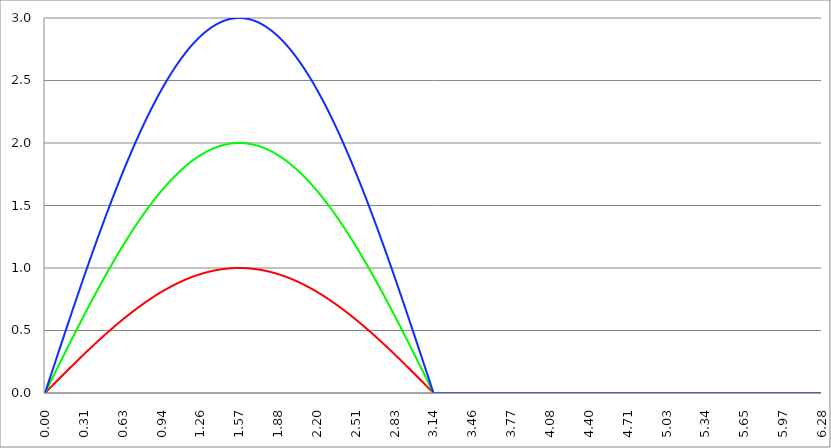
| Category | Series 1 | Series 0 | Series 2 |
|---|---|---|---|
| 0.0 | 0 | 0 | 0 |
| 0.00314159265358979 | 0.003 | 0.006 | 0.009 |
| 0.00628318530717958 | 0.006 | 0.013 | 0.019 |
| 0.00942477796076938 | 0.009 | 0.019 | 0.028 |
| 0.0125663706143592 | 0.013 | 0.025 | 0.038 |
| 0.015707963267949 | 0.016 | 0.031 | 0.047 |
| 0.0188495559215388 | 0.019 | 0.038 | 0.057 |
| 0.0219911485751285 | 0.022 | 0.044 | 0.066 |
| 0.0251327412287183 | 0.025 | 0.05 | 0.075 |
| 0.0282743338823081 | 0.028 | 0.057 | 0.085 |
| 0.0314159265358979 | 0.031 | 0.063 | 0.094 |
| 0.0345575191894877 | 0.035 | 0.069 | 0.104 |
| 0.0376991118430775 | 0.038 | 0.075 | 0.113 |
| 0.0408407044966673 | 0.041 | 0.082 | 0.122 |
| 0.0439822971502571 | 0.044 | 0.088 | 0.132 |
| 0.0471238898038469 | 0.047 | 0.094 | 0.141 |
| 0.0502654824574367 | 0.05 | 0.1 | 0.151 |
| 0.0534070751110265 | 0.053 | 0.107 | 0.16 |
| 0.0565486677646163 | 0.057 | 0.113 | 0.17 |
| 0.059690260418206 | 0.06 | 0.119 | 0.179 |
| 0.0628318530717958 | 0.063 | 0.126 | 0.188 |
| 0.0659734457253856 | 0.066 | 0.132 | 0.198 |
| 0.0691150383789754 | 0.069 | 0.138 | 0.207 |
| 0.0722566310325652 | 0.072 | 0.144 | 0.217 |
| 0.075398223686155 | 0.075 | 0.151 | 0.226 |
| 0.0785398163397448 | 0.078 | 0.157 | 0.235 |
| 0.0816814089933346 | 0.082 | 0.163 | 0.245 |
| 0.0848230016469244 | 0.085 | 0.169 | 0.254 |
| 0.0879645943005142 | 0.088 | 0.176 | 0.264 |
| 0.091106186954104 | 0.091 | 0.182 | 0.273 |
| 0.0942477796076937 | 0.094 | 0.188 | 0.282 |
| 0.0973893722612835 | 0.097 | 0.194 | 0.292 |
| 0.100530964914873 | 0.1 | 0.201 | 0.301 |
| 0.103672557568463 | 0.103 | 0.207 | 0.31 |
| 0.106814150222053 | 0.107 | 0.213 | 0.32 |
| 0.109955742875643 | 0.11 | 0.219 | 0.329 |
| 0.113097335529233 | 0.113 | 0.226 | 0.339 |
| 0.116238928182822 | 0.116 | 0.232 | 0.348 |
| 0.119380520836412 | 0.119 | 0.238 | 0.357 |
| 0.122522113490002 | 0.122 | 0.244 | 0.367 |
| 0.125663706143592 | 0.125 | 0.251 | 0.376 |
| 0.128805298797181 | 0.128 | 0.257 | 0.385 |
| 0.131946891450771 | 0.132 | 0.263 | 0.395 |
| 0.135088484104361 | 0.135 | 0.269 | 0.404 |
| 0.138230076757951 | 0.138 | 0.276 | 0.413 |
| 0.141371669411541 | 0.141 | 0.282 | 0.423 |
| 0.14451326206513 | 0.144 | 0.288 | 0.432 |
| 0.14765485471872 | 0.147 | 0.294 | 0.441 |
| 0.15079644737231 | 0.15 | 0.3 | 0.451 |
| 0.1539380400259 | 0.153 | 0.307 | 0.46 |
| 0.15707963267949 | 0.156 | 0.313 | 0.469 |
| 0.160221225333079 | 0.16 | 0.319 | 0.479 |
| 0.163362817986669 | 0.163 | 0.325 | 0.488 |
| 0.166504410640259 | 0.166 | 0.331 | 0.497 |
| 0.169646003293849 | 0.169 | 0.338 | 0.507 |
| 0.172787595947439 | 0.172 | 0.344 | 0.516 |
| 0.175929188601028 | 0.175 | 0.35 | 0.525 |
| 0.179070781254618 | 0.178 | 0.356 | 0.534 |
| 0.182212373908208 | 0.181 | 0.362 | 0.544 |
| 0.185353966561798 | 0.184 | 0.369 | 0.553 |
| 0.188495559215388 | 0.187 | 0.375 | 0.562 |
| 0.191637151868977 | 0.19 | 0.381 | 0.571 |
| 0.194778744522567 | 0.194 | 0.387 | 0.581 |
| 0.197920337176157 | 0.197 | 0.393 | 0.59 |
| 0.201061929829747 | 0.2 | 0.399 | 0.599 |
| 0.204203522483336 | 0.203 | 0.406 | 0.608 |
| 0.207345115136926 | 0.206 | 0.412 | 0.618 |
| 0.210486707790516 | 0.209 | 0.418 | 0.627 |
| 0.213628300444106 | 0.212 | 0.424 | 0.636 |
| 0.216769893097696 | 0.215 | 0.43 | 0.645 |
| 0.219911485751285 | 0.218 | 0.436 | 0.654 |
| 0.223053078404875 | 0.221 | 0.442 | 0.664 |
| 0.226194671058465 | 0.224 | 0.449 | 0.673 |
| 0.229336263712055 | 0.227 | 0.455 | 0.682 |
| 0.232477856365645 | 0.23 | 0.461 | 0.691 |
| 0.235619449019234 | 0.233 | 0.467 | 0.7 |
| 0.238761041672824 | 0.236 | 0.473 | 0.709 |
| 0.241902634326414 | 0.24 | 0.479 | 0.719 |
| 0.245044226980004 | 0.243 | 0.485 | 0.728 |
| 0.248185819633594 | 0.246 | 0.491 | 0.737 |
| 0.251327412287183 | 0.249 | 0.497 | 0.746 |
| 0.254469004940773 | 0.252 | 0.503 | 0.755 |
| 0.257610597594363 | 0.255 | 0.51 | 0.764 |
| 0.260752190247953 | 0.258 | 0.516 | 0.773 |
| 0.263893782901543 | 0.261 | 0.522 | 0.783 |
| 0.267035375555132 | 0.264 | 0.528 | 0.792 |
| 0.270176968208722 | 0.267 | 0.534 | 0.801 |
| 0.273318560862312 | 0.27 | 0.54 | 0.81 |
| 0.276460153515902 | 0.273 | 0.546 | 0.819 |
| 0.279601746169492 | 0.276 | 0.552 | 0.828 |
| 0.282743338823082 | 0.279 | 0.558 | 0.837 |
| 0.285884931476671 | 0.282 | 0.564 | 0.846 |
| 0.289026524130261 | 0.285 | 0.57 | 0.855 |
| 0.292168116783851 | 0.288 | 0.576 | 0.864 |
| 0.295309709437441 | 0.291 | 0.582 | 0.873 |
| 0.298451302091031 | 0.294 | 0.588 | 0.882 |
| 0.30159289474462 | 0.297 | 0.594 | 0.891 |
| 0.30473448739821 | 0.3 | 0.6 | 0.9 |
| 0.3078760800518 | 0.303 | 0.606 | 0.909 |
| 0.31101767270539 | 0.306 | 0.612 | 0.918 |
| 0.31415926535898 | 0.309 | 0.618 | 0.927 |
| 0.31730085801257 | 0.312 | 0.624 | 0.936 |
| 0.320442450666159 | 0.315 | 0.63 | 0.945 |
| 0.323584043319749 | 0.318 | 0.636 | 0.954 |
| 0.326725635973339 | 0.321 | 0.642 | 0.963 |
| 0.329867228626929 | 0.324 | 0.648 | 0.972 |
| 0.333008821280519 | 0.327 | 0.654 | 0.981 |
| 0.336150413934108 | 0.33 | 0.66 | 0.99 |
| 0.339292006587698 | 0.333 | 0.666 | 0.998 |
| 0.342433599241288 | 0.336 | 0.672 | 1.007 |
| 0.345575191894878 | 0.339 | 0.677 | 1.016 |
| 0.348716784548468 | 0.342 | 0.683 | 1.025 |
| 0.351858377202058 | 0.345 | 0.689 | 1.034 |
| 0.354999969855647 | 0.348 | 0.695 | 1.043 |
| 0.358141562509237 | 0.351 | 0.701 | 1.052 |
| 0.361283155162827 | 0.353 | 0.707 | 1.06 |
| 0.364424747816417 | 0.356 | 0.713 | 1.069 |
| 0.367566340470007 | 0.359 | 0.719 | 1.078 |
| 0.370707933123597 | 0.362 | 0.725 | 1.087 |
| 0.373849525777186 | 0.365 | 0.73 | 1.096 |
| 0.376991118430776 | 0.368 | 0.736 | 1.104 |
| 0.380132711084366 | 0.371 | 0.742 | 1.113 |
| 0.383274303737956 | 0.374 | 0.748 | 1.122 |
| 0.386415896391546 | 0.377 | 0.754 | 1.131 |
| 0.389557489045135 | 0.38 | 0.76 | 1.139 |
| 0.392699081698725 | 0.383 | 0.765 | 1.148 |
| 0.395840674352315 | 0.386 | 0.771 | 1.157 |
| 0.398982267005905 | 0.388 | 0.777 | 1.165 |
| 0.402123859659495 | 0.391 | 0.783 | 1.174 |
| 0.405265452313085 | 0.394 | 0.789 | 1.183 |
| 0.408407044966674 | 0.397 | 0.794 | 1.191 |
| 0.411548637620264 | 0.4 | 0.8 | 1.2 |
| 0.414690230273854 | 0.403 | 0.806 | 1.209 |
| 0.417831822927444 | 0.406 | 0.812 | 1.217 |
| 0.420973415581034 | 0.409 | 0.817 | 1.226 |
| 0.424115008234623 | 0.412 | 0.823 | 1.235 |
| 0.427256600888213 | 0.414 | 0.829 | 1.243 |
| 0.430398193541803 | 0.417 | 0.834 | 1.252 |
| 0.433539786195393 | 0.42 | 0.84 | 1.26 |
| 0.436681378848983 | 0.423 | 0.846 | 1.269 |
| 0.439822971502573 | 0.426 | 0.852 | 1.277 |
| 0.442964564156162 | 0.429 | 0.857 | 1.286 |
| 0.446106156809752 | 0.431 | 0.863 | 1.294 |
| 0.449247749463342 | 0.434 | 0.869 | 1.303 |
| 0.452389342116932 | 0.437 | 0.874 | 1.311 |
| 0.455530934770522 | 0.44 | 0.88 | 1.32 |
| 0.458672527424111 | 0.443 | 0.886 | 1.328 |
| 0.461814120077701 | 0.446 | 0.891 | 1.337 |
| 0.464955712731291 | 0.448 | 0.897 | 1.345 |
| 0.468097305384881 | 0.451 | 0.902 | 1.354 |
| 0.471238898038471 | 0.454 | 0.908 | 1.362 |
| 0.474380490692061 | 0.457 | 0.914 | 1.37 |
| 0.47752208334565 | 0.46 | 0.919 | 1.379 |
| 0.48066367599924 | 0.462 | 0.925 | 1.387 |
| 0.48380526865283 | 0.465 | 0.93 | 1.395 |
| 0.48694686130642 | 0.468 | 0.936 | 1.404 |
| 0.49008845396001 | 0.471 | 0.941 | 1.412 |
| 0.493230046613599 | 0.473 | 0.947 | 1.42 |
| 0.496371639267189 | 0.476 | 0.952 | 1.429 |
| 0.499513231920779 | 0.479 | 0.958 | 1.437 |
| 0.502654824574369 | 0.482 | 0.964 | 1.445 |
| 0.505796417227959 | 0.485 | 0.969 | 1.454 |
| 0.508938009881549 | 0.487 | 0.975 | 1.462 |
| 0.512079602535138 | 0.49 | 0.98 | 1.47 |
| 0.515221195188728 | 0.493 | 0.985 | 1.478 |
| 0.518362787842318 | 0.495 | 0.991 | 1.486 |
| 0.521504380495908 | 0.498 | 0.996 | 1.495 |
| 0.524645973149498 | 0.501 | 1.002 | 1.503 |
| 0.527787565803087 | 0.504 | 1.007 | 1.511 |
| 0.530929158456677 | 0.506 | 1.013 | 1.519 |
| 0.534070751110267 | 0.509 | 1.018 | 1.527 |
| 0.537212343763857 | 0.512 | 1.023 | 1.535 |
| 0.540353936417447 | 0.514 | 1.029 | 1.543 |
| 0.543495529071037 | 0.517 | 1.034 | 1.551 |
| 0.546637121724626 | 0.52 | 1.04 | 1.559 |
| 0.549778714378216 | 0.522 | 1.045 | 1.567 |
| 0.552920307031806 | 0.525 | 1.05 | 1.576 |
| 0.556061899685396 | 0.528 | 1.056 | 1.584 |
| 0.559203492338986 | 0.531 | 1.061 | 1.592 |
| 0.562345084992576 | 0.533 | 1.066 | 1.6 |
| 0.565486677646165 | 0.536 | 1.072 | 1.607 |
| 0.568628270299755 | 0.538 | 1.077 | 1.615 |
| 0.571769862953345 | 0.541 | 1.082 | 1.623 |
| 0.574911455606935 | 0.544 | 1.088 | 1.631 |
| 0.578053048260525 | 0.546 | 1.093 | 1.639 |
| 0.581194640914114 | 0.549 | 1.098 | 1.647 |
| 0.584336233567704 | 0.552 | 1.103 | 1.655 |
| 0.587477826221294 | 0.554 | 1.109 | 1.663 |
| 0.590619418874884 | 0.557 | 1.114 | 1.671 |
| 0.593761011528474 | 0.559 | 1.119 | 1.678 |
| 0.596902604182064 | 0.562 | 1.124 | 1.686 |
| 0.600044196835653 | 0.565 | 1.129 | 1.694 |
| 0.603185789489243 | 0.567 | 1.135 | 1.702 |
| 0.606327382142833 | 0.57 | 1.14 | 1.71 |
| 0.609468974796423 | 0.572 | 1.145 | 1.717 |
| 0.612610567450013 | 0.575 | 1.15 | 1.725 |
| 0.615752160103602 | 0.578 | 1.155 | 1.733 |
| 0.618893752757192 | 0.58 | 1.16 | 1.74 |
| 0.622035345410782 | 0.583 | 1.165 | 1.748 |
| 0.625176938064372 | 0.585 | 1.17 | 1.756 |
| 0.628318530717962 | 0.588 | 1.176 | 1.763 |
| 0.631460123371551 | 0.59 | 1.181 | 1.771 |
| 0.634601716025141 | 0.593 | 1.186 | 1.779 |
| 0.637743308678731 | 0.595 | 1.191 | 1.786 |
| 0.640884901332321 | 0.598 | 1.196 | 1.794 |
| 0.644026493985911 | 0.6 | 1.201 | 1.801 |
| 0.647168086639501 | 0.603 | 1.206 | 1.809 |
| 0.65030967929309 | 0.605 | 1.211 | 1.816 |
| 0.65345127194668 | 0.608 | 1.216 | 1.824 |
| 0.65659286460027 | 0.61 | 1.221 | 1.831 |
| 0.65973445725386 | 0.613 | 1.226 | 1.839 |
| 0.66287604990745 | 0.615 | 1.231 | 1.846 |
| 0.666017642561039 | 0.618 | 1.236 | 1.854 |
| 0.669159235214629 | 0.62 | 1.241 | 1.861 |
| 0.672300827868219 | 0.623 | 1.246 | 1.868 |
| 0.675442420521809 | 0.625 | 1.25 | 1.876 |
| 0.678584013175399 | 0.628 | 1.255 | 1.883 |
| 0.681725605828989 | 0.63 | 1.26 | 1.89 |
| 0.684867198482578 | 0.633 | 1.265 | 1.898 |
| 0.688008791136168 | 0.635 | 1.27 | 1.905 |
| 0.691150383789758 | 0.637 | 1.275 | 1.912 |
| 0.694291976443348 | 0.64 | 1.28 | 1.92 |
| 0.697433569096938 | 0.642 | 1.285 | 1.927 |
| 0.700575161750528 | 0.645 | 1.289 | 1.934 |
| 0.703716754404117 | 0.647 | 1.294 | 1.941 |
| 0.706858347057707 | 0.649 | 1.299 | 1.948 |
| 0.709999939711297 | 0.652 | 1.304 | 1.956 |
| 0.713141532364887 | 0.654 | 1.308 | 1.963 |
| 0.716283125018477 | 0.657 | 1.313 | 1.97 |
| 0.719424717672066 | 0.659 | 1.318 | 1.977 |
| 0.722566310325656 | 0.661 | 1.323 | 1.984 |
| 0.725707902979246 | 0.664 | 1.327 | 1.991 |
| 0.728849495632836 | 0.666 | 1.332 | 1.998 |
| 0.731991088286426 | 0.668 | 1.337 | 2.005 |
| 0.735132680940016 | 0.671 | 1.341 | 2.012 |
| 0.738274273593605 | 0.673 | 1.346 | 2.019 |
| 0.741415866247195 | 0.675 | 1.351 | 2.026 |
| 0.744557458900785 | 0.678 | 1.355 | 2.033 |
| 0.747699051554375 | 0.68 | 1.36 | 2.04 |
| 0.750840644207965 | 0.682 | 1.365 | 2.047 |
| 0.753982236861554 | 0.685 | 1.369 | 2.054 |
| 0.757123829515144 | 0.687 | 1.374 | 2.061 |
| 0.760265422168734 | 0.689 | 1.378 | 2.067 |
| 0.763407014822324 | 0.691 | 1.383 | 2.074 |
| 0.766548607475914 | 0.694 | 1.387 | 2.081 |
| 0.769690200129504 | 0.696 | 1.392 | 2.088 |
| 0.772831792783093 | 0.698 | 1.396 | 2.094 |
| 0.775973385436683 | 0.7 | 1.401 | 2.101 |
| 0.779114978090273 | 0.703 | 1.405 | 2.108 |
| 0.782256570743863 | 0.705 | 1.41 | 2.115 |
| 0.785398163397453 | 0.707 | 1.414 | 2.121 |
| 0.788539756051042 | 0.709 | 1.419 | 2.128 |
| 0.791681348704632 | 0.712 | 1.423 | 2.135 |
| 0.794822941358222 | 0.714 | 1.427 | 2.141 |
| 0.797964534011812 | 0.716 | 1.432 | 2.148 |
| 0.801106126665402 | 0.718 | 1.436 | 2.154 |
| 0.804247719318992 | 0.72 | 1.441 | 2.161 |
| 0.807389311972581 | 0.722 | 1.445 | 2.167 |
| 0.810530904626171 | 0.725 | 1.449 | 2.174 |
| 0.813672497279761 | 0.727 | 1.454 | 2.18 |
| 0.816814089933351 | 0.729 | 1.458 | 2.187 |
| 0.819955682586941 | 0.731 | 1.462 | 2.193 |
| 0.823097275240531 | 0.733 | 1.467 | 2.2 |
| 0.82623886789412 | 0.735 | 1.471 | 2.206 |
| 0.82938046054771 | 0.738 | 1.475 | 2.213 |
| 0.8325220532013 | 0.74 | 1.479 | 2.219 |
| 0.83566364585489 | 0.742 | 1.483 | 2.225 |
| 0.83880523850848 | 0.744 | 1.488 | 2.232 |
| 0.841946831162069 | 0.746 | 1.492 | 2.238 |
| 0.845088423815659 | 0.748 | 1.496 | 2.244 |
| 0.848230016469249 | 0.75 | 1.5 | 2.25 |
| 0.851371609122839 | 0.752 | 1.504 | 2.257 |
| 0.854513201776429 | 0.754 | 1.509 | 2.263 |
| 0.857654794430019 | 0.756 | 1.513 | 2.269 |
| 0.860796387083608 | 0.758 | 1.517 | 2.275 |
| 0.863937979737198 | 0.76 | 1.521 | 2.281 |
| 0.867079572390788 | 0.762 | 1.525 | 2.287 |
| 0.870221165044378 | 0.764 | 1.529 | 2.293 |
| 0.873362757697968 | 0.766 | 1.533 | 2.299 |
| 0.876504350351557 | 0.769 | 1.537 | 2.306 |
| 0.879645943005147 | 0.771 | 1.541 | 2.312 |
| 0.882787535658737 | 0.773 | 1.545 | 2.318 |
| 0.885929128312327 | 0.775 | 1.549 | 2.324 |
| 0.889070720965917 | 0.776 | 1.553 | 2.329 |
| 0.892212313619507 | 0.778 | 1.557 | 2.335 |
| 0.895353906273096 | 0.78 | 1.561 | 2.341 |
| 0.898495498926686 | 0.782 | 1.565 | 2.347 |
| 0.901637091580276 | 0.784 | 1.569 | 2.353 |
| 0.904778684233866 | 0.786 | 1.573 | 2.359 |
| 0.907920276887456 | 0.788 | 1.576 | 2.365 |
| 0.911061869541045 | 0.79 | 1.58 | 2.37 |
| 0.914203462194635 | 0.792 | 1.584 | 2.376 |
| 0.917345054848225 | 0.794 | 1.588 | 2.382 |
| 0.920486647501815 | 0.796 | 1.592 | 2.388 |
| 0.923628240155405 | 0.798 | 1.596 | 2.393 |
| 0.926769832808995 | 0.8 | 1.599 | 2.399 |
| 0.929911425462584 | 0.802 | 1.603 | 2.405 |
| 0.933053018116174 | 0.803 | 1.607 | 2.41 |
| 0.936194610769764 | 0.805 | 1.611 | 2.416 |
| 0.939336203423354 | 0.807 | 1.614 | 2.421 |
| 0.942477796076944 | 0.809 | 1.618 | 2.427 |
| 0.945619388730533 | 0.811 | 1.622 | 2.433 |
| 0.948760981384123 | 0.813 | 1.625 | 2.438 |
| 0.951902574037713 | 0.815 | 1.629 | 2.444 |
| 0.955044166691303 | 0.816 | 1.633 | 2.449 |
| 0.958185759344893 | 0.818 | 1.636 | 2.454 |
| 0.961327351998483 | 0.82 | 1.64 | 2.46 |
| 0.964468944652072 | 0.822 | 1.643 | 2.465 |
| 0.967610537305662 | 0.824 | 1.647 | 2.471 |
| 0.970752129959252 | 0.825 | 1.651 | 2.476 |
| 0.973893722612842 | 0.827 | 1.654 | 2.481 |
| 0.977035315266432 | 0.829 | 1.658 | 2.487 |
| 0.980176907920022 | 0.831 | 1.661 | 2.492 |
| 0.983318500573611 | 0.832 | 1.665 | 2.497 |
| 0.986460093227201 | 0.834 | 1.668 | 2.502 |
| 0.989601685880791 | 0.836 | 1.672 | 2.507 |
| 0.992743278534381 | 0.838 | 1.675 | 2.513 |
| 0.995884871187971 | 0.839 | 1.678 | 2.518 |
| 0.99902646384156 | 0.841 | 1.682 | 2.523 |
| 1.00216805649515 | 0.843 | 1.685 | 2.528 |
| 1.00530964914874 | 0.844 | 1.689 | 2.533 |
| 1.00845124180233 | 0.846 | 1.692 | 2.538 |
| 1.01159283445592 | 0.848 | 1.695 | 2.543 |
| 1.01473442710951 | 0.849 | 1.699 | 2.548 |
| 1.017876019763099 | 0.851 | 1.702 | 2.553 |
| 1.021017612416689 | 0.853 | 1.705 | 2.558 |
| 1.02415920507028 | 0.854 | 1.709 | 2.563 |
| 1.027300797723869 | 0.856 | 1.712 | 2.568 |
| 1.030442390377459 | 0.858 | 1.715 | 2.573 |
| 1.033583983031048 | 0.859 | 1.718 | 2.577 |
| 1.036725575684638 | 0.861 | 1.721 | 2.582 |
| 1.039867168338228 | 0.862 | 1.725 | 2.587 |
| 1.043008760991818 | 0.864 | 1.728 | 2.592 |
| 1.046150353645408 | 0.866 | 1.731 | 2.597 |
| 1.049291946298998 | 0.867 | 1.734 | 2.601 |
| 1.052433538952587 | 0.869 | 1.737 | 2.606 |
| 1.055575131606177 | 0.87 | 1.74 | 2.611 |
| 1.058716724259767 | 0.872 | 1.743 | 2.615 |
| 1.061858316913357 | 0.873 | 1.747 | 2.62 |
| 1.064999909566947 | 0.875 | 1.75 | 2.624 |
| 1.068141502220536 | 0.876 | 1.753 | 2.629 |
| 1.071283094874126 | 0.878 | 1.756 | 2.633 |
| 1.074424687527716 | 0.879 | 1.759 | 2.638 |
| 1.077566280181306 | 0.881 | 1.762 | 2.642 |
| 1.080707872834896 | 0.882 | 1.765 | 2.647 |
| 1.083849465488486 | 0.884 | 1.768 | 2.651 |
| 1.086991058142075 | 0.885 | 1.77 | 2.656 |
| 1.090132650795665 | 0.887 | 1.773 | 2.66 |
| 1.093274243449255 | 0.888 | 1.776 | 2.664 |
| 1.096415836102845 | 0.89 | 1.779 | 2.669 |
| 1.099557428756435 | 0.891 | 1.782 | 2.673 |
| 1.102699021410025 | 0.892 | 1.785 | 2.677 |
| 1.105840614063614 | 0.894 | 1.788 | 2.682 |
| 1.108982206717204 | 0.895 | 1.79 | 2.686 |
| 1.112123799370794 | 0.897 | 1.793 | 2.69 |
| 1.115265392024384 | 0.898 | 1.796 | 2.694 |
| 1.118406984677974 | 0.899 | 1.799 | 2.698 |
| 1.121548577331563 | 0.901 | 1.802 | 2.702 |
| 1.124690169985153 | 0.902 | 1.804 | 2.706 |
| 1.127831762638743 | 0.903 | 1.807 | 2.71 |
| 1.130973355292333 | 0.905 | 1.81 | 2.714 |
| 1.134114947945923 | 0.906 | 1.812 | 2.718 |
| 1.137256540599513 | 0.907 | 1.815 | 2.722 |
| 1.140398133253102 | 0.909 | 1.818 | 2.726 |
| 1.143539725906692 | 0.91 | 1.82 | 2.73 |
| 1.146681318560282 | 0.911 | 1.823 | 2.734 |
| 1.149822911213872 | 0.913 | 1.825 | 2.738 |
| 1.152964503867462 | 0.914 | 1.828 | 2.742 |
| 1.156106096521051 | 0.915 | 1.83 | 2.746 |
| 1.159247689174641 | 0.917 | 1.833 | 2.75 |
| 1.162389281828231 | 0.918 | 1.836 | 2.753 |
| 1.165530874481821 | 0.919 | 1.838 | 2.757 |
| 1.168672467135411 | 0.92 | 1.84 | 2.761 |
| 1.171814059789001 | 0.921 | 1.843 | 2.764 |
| 1.17495565244259 | 0.923 | 1.845 | 2.768 |
| 1.17809724509618 | 0.924 | 1.848 | 2.772 |
| 1.18123883774977 | 0.925 | 1.85 | 2.775 |
| 1.18438043040336 | 0.926 | 1.853 | 2.779 |
| 1.18752202305695 | 0.927 | 1.855 | 2.782 |
| 1.190663615710539 | 0.929 | 1.857 | 2.786 |
| 1.193805208364129 | 0.93 | 1.86 | 2.789 |
| 1.19694680101772 | 0.931 | 1.862 | 2.793 |
| 1.200088393671309 | 0.932 | 1.864 | 2.796 |
| 1.203229986324899 | 0.933 | 1.866 | 2.8 |
| 1.206371578978489 | 0.934 | 1.869 | 2.803 |
| 1.209513171632078 | 0.935 | 1.871 | 2.806 |
| 1.212654764285668 | 0.937 | 1.873 | 2.81 |
| 1.215796356939258 | 0.938 | 1.875 | 2.813 |
| 1.218937949592848 | 0.939 | 1.877 | 2.816 |
| 1.222079542246438 | 0.94 | 1.88 | 2.819 |
| 1.225221134900027 | 0.941 | 1.882 | 2.823 |
| 1.228362727553617 | 0.942 | 1.884 | 2.826 |
| 1.231504320207207 | 0.943 | 1.886 | 2.829 |
| 1.234645912860797 | 0.944 | 1.888 | 2.832 |
| 1.237787505514387 | 0.945 | 1.89 | 2.835 |
| 1.240929098167977 | 0.946 | 1.892 | 2.838 |
| 1.244070690821566 | 0.947 | 1.894 | 2.841 |
| 1.247212283475156 | 0.948 | 1.896 | 2.844 |
| 1.250353876128746 | 0.949 | 1.898 | 2.847 |
| 1.253495468782336 | 0.95 | 1.9 | 2.85 |
| 1.256637061435926 | 0.951 | 1.902 | 2.853 |
| 1.259778654089515 | 0.952 | 1.904 | 2.856 |
| 1.262920246743105 | 0.953 | 1.906 | 2.859 |
| 1.266061839396695 | 0.954 | 1.908 | 2.862 |
| 1.269203432050285 | 0.955 | 1.91 | 2.865 |
| 1.272345024703875 | 0.956 | 1.912 | 2.867 |
| 1.275486617357465 | 0.957 | 1.913 | 2.87 |
| 1.278628210011054 | 0.958 | 1.915 | 2.873 |
| 1.281769802664644 | 0.959 | 1.917 | 2.876 |
| 1.284911395318234 | 0.959 | 1.919 | 2.878 |
| 1.288052987971824 | 0.96 | 1.921 | 2.881 |
| 1.291194580625414 | 0.961 | 1.922 | 2.883 |
| 1.294336173279003 | 0.962 | 1.924 | 2.886 |
| 1.297477765932593 | 0.963 | 1.926 | 2.889 |
| 1.300619358586183 | 0.964 | 1.927 | 2.891 |
| 1.303760951239773 | 0.965 | 1.929 | 2.894 |
| 1.306902543893363 | 0.965 | 1.931 | 2.896 |
| 1.310044136546953 | 0.966 | 1.932 | 2.899 |
| 1.313185729200542 | 0.967 | 1.934 | 2.901 |
| 1.316327321854132 | 0.968 | 1.936 | 2.903 |
| 1.319468914507722 | 0.969 | 1.937 | 2.906 |
| 1.322610507161312 | 0.969 | 1.939 | 2.908 |
| 1.325752099814902 | 0.97 | 1.94 | 2.91 |
| 1.328893692468491 | 0.971 | 1.942 | 2.913 |
| 1.332035285122081 | 0.972 | 1.943 | 2.915 |
| 1.335176877775671 | 0.972 | 1.945 | 2.917 |
| 1.338318470429261 | 0.973 | 1.946 | 2.919 |
| 1.341460063082851 | 0.974 | 1.948 | 2.921 |
| 1.344601655736441 | 0.975 | 1.949 | 2.924 |
| 1.34774324839003 | 0.975 | 1.95 | 2.926 |
| 1.35088484104362 | 0.976 | 1.952 | 2.928 |
| 1.35402643369721 | 0.977 | 1.953 | 2.93 |
| 1.3571680263508 | 0.977 | 1.955 | 2.932 |
| 1.36030961900439 | 0.978 | 1.956 | 2.934 |
| 1.363451211657979 | 0.979 | 1.957 | 2.936 |
| 1.36659280431157 | 0.979 | 1.958 | 2.938 |
| 1.369734396965159 | 0.98 | 1.96 | 2.94 |
| 1.372875989618749 | 0.98 | 1.961 | 2.941 |
| 1.376017582272339 | 0.981 | 1.962 | 2.943 |
| 1.379159174925929 | 0.982 | 1.963 | 2.945 |
| 1.382300767579518 | 0.982 | 1.965 | 2.947 |
| 1.385442360233108 | 0.983 | 1.966 | 2.949 |
| 1.388583952886698 | 0.983 | 1.967 | 2.95 |
| 1.391725545540288 | 0.984 | 1.968 | 2.952 |
| 1.394867138193878 | 0.985 | 1.969 | 2.954 |
| 1.398008730847468 | 0.985 | 1.97 | 2.955 |
| 1.401150323501057 | 0.986 | 1.971 | 2.957 |
| 1.404291916154647 | 0.986 | 1.972 | 2.959 |
| 1.407433508808237 | 0.987 | 1.973 | 2.96 |
| 1.410575101461827 | 0.987 | 1.974 | 2.962 |
| 1.413716694115417 | 0.988 | 1.975 | 2.963 |
| 1.416858286769006 | 0.988 | 1.976 | 2.965 |
| 1.419999879422596 | 0.989 | 1.977 | 2.966 |
| 1.423141472076186 | 0.989 | 1.978 | 2.967 |
| 1.426283064729776 | 0.99 | 1.979 | 2.969 |
| 1.429424657383366 | 0.99 | 1.98 | 2.97 |
| 1.432566250036956 | 0.99 | 1.981 | 2.971 |
| 1.435707842690545 | 0.991 | 1.982 | 2.973 |
| 1.438849435344135 | 0.991 | 1.983 | 2.974 |
| 1.441991027997725 | 0.992 | 1.983 | 2.975 |
| 1.445132620651315 | 0.992 | 1.984 | 2.976 |
| 1.448274213304905 | 0.993 | 1.985 | 2.978 |
| 1.451415805958494 | 0.993 | 1.986 | 2.979 |
| 1.454557398612084 | 0.993 | 1.987 | 2.98 |
| 1.457698991265674 | 0.994 | 1.987 | 2.981 |
| 1.460840583919264 | 0.994 | 1.988 | 2.982 |
| 1.463982176572854 | 0.994 | 1.989 | 2.983 |
| 1.467123769226444 | 0.995 | 1.989 | 2.984 |
| 1.470265361880033 | 0.995 | 1.99 | 2.985 |
| 1.473406954533623 | 0.995 | 1.991 | 2.986 |
| 1.476548547187213 | 0.996 | 1.991 | 2.987 |
| 1.479690139840803 | 0.996 | 1.992 | 2.988 |
| 1.482831732494393 | 0.996 | 1.992 | 2.988 |
| 1.485973325147982 | 0.996 | 1.993 | 2.989 |
| 1.489114917801572 | 0.997 | 1.993 | 2.99 |
| 1.492256510455162 | 0.997 | 1.994 | 2.991 |
| 1.495398103108752 | 0.997 | 1.994 | 2.991 |
| 1.498539695762342 | 0.997 | 1.995 | 2.992 |
| 1.501681288415932 | 0.998 | 1.995 | 2.993 |
| 1.504822881069521 | 0.998 | 1.996 | 2.993 |
| 1.507964473723111 | 0.998 | 1.996 | 2.994 |
| 1.511106066376701 | 0.998 | 1.996 | 2.995 |
| 1.514247659030291 | 0.998 | 1.997 | 2.995 |
| 1.517389251683881 | 0.999 | 1.997 | 2.996 |
| 1.520530844337471 | 0.999 | 1.997 | 2.996 |
| 1.52367243699106 | 0.999 | 1.998 | 2.997 |
| 1.52681402964465 | 0.999 | 1.998 | 2.997 |
| 1.52995562229824 | 0.999 | 1.998 | 2.997 |
| 1.53309721495183 | 0.999 | 1.999 | 2.998 |
| 1.53623880760542 | 0.999 | 1.999 | 2.998 |
| 1.539380400259009 | 1 | 1.999 | 2.999 |
| 1.542521992912599 | 1 | 1.999 | 2.999 |
| 1.545663585566189 | 1 | 1.999 | 2.999 |
| 1.548805178219779 | 1 | 2 | 2.999 |
| 1.551946770873369 | 1 | 2 | 2.999 |
| 1.555088363526959 | 1 | 2 | 3 |
| 1.558229956180548 | 1 | 2 | 3 |
| 1.561371548834138 | 1 | 2 | 3 |
| 1.564513141487728 | 1 | 2 | 3 |
| 1.567654734141318 | 1 | 2 | 3 |
| 1.570796326794908 | 1 | 2 | 3 |
| 1.573937919448497 | 1 | 2 | 3 |
| 1.577079512102087 | 1 | 2 | 3 |
| 1.580221104755677 | 1 | 2 | 3 |
| 1.583362697409267 | 1 | 2 | 3 |
| 1.586504290062857 | 1 | 2 | 3 |
| 1.589645882716447 | 1 | 2 | 2.999 |
| 1.592787475370036 | 1 | 2 | 2.999 |
| 1.595929068023626 | 1 | 1.999 | 2.999 |
| 1.599070660677216 | 1 | 1.999 | 2.999 |
| 1.602212253330806 | 1 | 1.999 | 2.999 |
| 1.605353845984396 | 0.999 | 1.999 | 2.998 |
| 1.608495438637985 | 0.999 | 1.999 | 2.998 |
| 1.611637031291575 | 0.999 | 1.998 | 2.997 |
| 1.614778623945165 | 0.999 | 1.998 | 2.997 |
| 1.617920216598755 | 0.999 | 1.998 | 2.997 |
| 1.621061809252345 | 0.999 | 1.997 | 2.996 |
| 1.624203401905935 | 0.999 | 1.997 | 2.996 |
| 1.627344994559524 | 0.998 | 1.997 | 2.995 |
| 1.630486587213114 | 0.998 | 1.996 | 2.995 |
| 1.633628179866704 | 0.998 | 1.996 | 2.994 |
| 1.636769772520294 | 0.998 | 1.996 | 2.993 |
| 1.639911365173884 | 0.998 | 1.995 | 2.993 |
| 1.643052957827473 | 0.997 | 1.995 | 2.992 |
| 1.646194550481063 | 0.997 | 1.994 | 2.991 |
| 1.649336143134653 | 0.997 | 1.994 | 2.991 |
| 1.652477735788243 | 0.997 | 1.993 | 2.99 |
| 1.655619328441833 | 0.996 | 1.993 | 2.989 |
| 1.658760921095423 | 0.996 | 1.992 | 2.988 |
| 1.661902513749012 | 0.996 | 1.992 | 2.988 |
| 1.665044106402602 | 0.996 | 1.991 | 2.987 |
| 1.668185699056192 | 0.995 | 1.991 | 2.986 |
| 1.671327291709782 | 0.995 | 1.99 | 2.985 |
| 1.674468884363372 | 0.995 | 1.989 | 2.984 |
| 1.677610477016961 | 0.994 | 1.989 | 2.983 |
| 1.680752069670551 | 0.994 | 1.988 | 2.982 |
| 1.683893662324141 | 0.994 | 1.987 | 2.981 |
| 1.687035254977731 | 0.993 | 1.987 | 2.98 |
| 1.690176847631321 | 0.993 | 1.986 | 2.979 |
| 1.693318440284911 | 0.993 | 1.985 | 2.978 |
| 1.6964600329385 | 0.992 | 1.984 | 2.976 |
| 1.69960162559209 | 0.992 | 1.983 | 2.975 |
| 1.70274321824568 | 0.991 | 1.983 | 2.974 |
| 1.70588481089927 | 0.991 | 1.982 | 2.973 |
| 1.70902640355286 | 0.99 | 1.981 | 2.971 |
| 1.712167996206449 | 0.99 | 1.98 | 2.97 |
| 1.715309588860039 | 0.99 | 1.979 | 2.969 |
| 1.71845118151363 | 0.989 | 1.978 | 2.967 |
| 1.721592774167219 | 0.989 | 1.977 | 2.966 |
| 1.724734366820809 | 0.988 | 1.976 | 2.965 |
| 1.727875959474399 | 0.988 | 1.975 | 2.963 |
| 1.731017552127988 | 0.987 | 1.974 | 2.962 |
| 1.734159144781578 | 0.987 | 1.973 | 2.96 |
| 1.737300737435168 | 0.986 | 1.972 | 2.959 |
| 1.740442330088758 | 0.986 | 1.971 | 2.957 |
| 1.743583922742348 | 0.985 | 1.97 | 2.955 |
| 1.746725515395937 | 0.985 | 1.969 | 2.954 |
| 1.749867108049527 | 0.984 | 1.968 | 2.952 |
| 1.753008700703117 | 0.983 | 1.967 | 2.95 |
| 1.756150293356707 | 0.983 | 1.966 | 2.949 |
| 1.759291886010297 | 0.982 | 1.965 | 2.947 |
| 1.762433478663887 | 0.982 | 1.963 | 2.945 |
| 1.765575071317476 | 0.981 | 1.962 | 2.943 |
| 1.768716663971066 | 0.98 | 1.961 | 2.941 |
| 1.771858256624656 | 0.98 | 1.96 | 2.94 |
| 1.774999849278246 | 0.979 | 1.958 | 2.938 |
| 1.778141441931836 | 0.979 | 1.957 | 2.936 |
| 1.781283034585426 | 0.978 | 1.956 | 2.934 |
| 1.784424627239015 | 0.977 | 1.955 | 2.932 |
| 1.787566219892605 | 0.977 | 1.953 | 2.93 |
| 1.790707812546195 | 0.976 | 1.952 | 2.928 |
| 1.793849405199785 | 0.975 | 1.95 | 2.926 |
| 1.796990997853375 | 0.975 | 1.949 | 2.924 |
| 1.800132590506964 | 0.974 | 1.948 | 2.921 |
| 1.803274183160554 | 0.973 | 1.946 | 2.919 |
| 1.806415775814144 | 0.972 | 1.945 | 2.917 |
| 1.809557368467734 | 0.972 | 1.943 | 2.915 |
| 1.812698961121324 | 0.971 | 1.942 | 2.913 |
| 1.815840553774914 | 0.97 | 1.94 | 2.91 |
| 1.818982146428503 | 0.969 | 1.939 | 2.908 |
| 1.822123739082093 | 0.969 | 1.937 | 2.906 |
| 1.825265331735683 | 0.968 | 1.936 | 2.903 |
| 1.828406924389273 | 0.967 | 1.934 | 2.901 |
| 1.831548517042863 | 0.966 | 1.932 | 2.899 |
| 1.834690109696452 | 0.965 | 1.931 | 2.896 |
| 1.837831702350042 | 0.965 | 1.929 | 2.894 |
| 1.840973295003632 | 0.964 | 1.927 | 2.891 |
| 1.844114887657222 | 0.963 | 1.926 | 2.889 |
| 1.847256480310812 | 0.962 | 1.924 | 2.886 |
| 1.850398072964402 | 0.961 | 1.922 | 2.883 |
| 1.853539665617991 | 0.96 | 1.921 | 2.881 |
| 1.856681258271581 | 0.959 | 1.919 | 2.878 |
| 1.859822850925171 | 0.959 | 1.917 | 2.876 |
| 1.862964443578761 | 0.958 | 1.915 | 2.873 |
| 1.866106036232351 | 0.957 | 1.913 | 2.87 |
| 1.86924762888594 | 0.956 | 1.912 | 2.867 |
| 1.87238922153953 | 0.955 | 1.91 | 2.865 |
| 1.87553081419312 | 0.954 | 1.908 | 2.862 |
| 1.87867240684671 | 0.953 | 1.906 | 2.859 |
| 1.8818139995003 | 0.952 | 1.904 | 2.856 |
| 1.88495559215389 | 0.951 | 1.902 | 2.853 |
| 1.888097184807479 | 0.95 | 1.9 | 2.85 |
| 1.891238777461069 | 0.949 | 1.898 | 2.847 |
| 1.89438037011466 | 0.948 | 1.896 | 2.844 |
| 1.897521962768249 | 0.947 | 1.894 | 2.841 |
| 1.900663555421839 | 0.946 | 1.892 | 2.838 |
| 1.903805148075429 | 0.945 | 1.89 | 2.835 |
| 1.906946740729018 | 0.944 | 1.888 | 2.832 |
| 1.910088333382608 | 0.943 | 1.886 | 2.829 |
| 1.913229926036198 | 0.942 | 1.884 | 2.826 |
| 1.916371518689788 | 0.941 | 1.882 | 2.823 |
| 1.919513111343378 | 0.94 | 1.88 | 2.819 |
| 1.922654703996967 | 0.939 | 1.877 | 2.816 |
| 1.925796296650557 | 0.938 | 1.875 | 2.813 |
| 1.928937889304147 | 0.937 | 1.873 | 2.81 |
| 1.932079481957737 | 0.935 | 1.871 | 2.806 |
| 1.935221074611327 | 0.934 | 1.869 | 2.803 |
| 1.938362667264917 | 0.933 | 1.866 | 2.8 |
| 1.941504259918506 | 0.932 | 1.864 | 2.796 |
| 1.944645852572096 | 0.931 | 1.862 | 2.793 |
| 1.947787445225686 | 0.93 | 1.86 | 2.789 |
| 1.950929037879276 | 0.929 | 1.857 | 2.786 |
| 1.954070630532866 | 0.927 | 1.855 | 2.782 |
| 1.957212223186455 | 0.926 | 1.853 | 2.779 |
| 1.960353815840045 | 0.925 | 1.85 | 2.775 |
| 1.963495408493635 | 0.924 | 1.848 | 2.772 |
| 1.966637001147225 | 0.923 | 1.845 | 2.768 |
| 1.969778593800815 | 0.921 | 1.843 | 2.764 |
| 1.972920186454405 | 0.92 | 1.84 | 2.761 |
| 1.976061779107994 | 0.919 | 1.838 | 2.757 |
| 1.979203371761584 | 0.918 | 1.836 | 2.753 |
| 1.982344964415174 | 0.917 | 1.833 | 2.75 |
| 1.985486557068764 | 0.915 | 1.83 | 2.746 |
| 1.988628149722354 | 0.914 | 1.828 | 2.742 |
| 1.991769742375943 | 0.913 | 1.825 | 2.738 |
| 1.994911335029533 | 0.911 | 1.823 | 2.734 |
| 1.998052927683123 | 0.91 | 1.82 | 2.73 |
| 2.001194520336712 | 0.909 | 1.818 | 2.726 |
| 2.004336112990302 | 0.907 | 1.815 | 2.722 |
| 2.007477705643892 | 0.906 | 1.812 | 2.718 |
| 2.010619298297482 | 0.905 | 1.81 | 2.714 |
| 2.013760890951071 | 0.903 | 1.807 | 2.71 |
| 2.016902483604661 | 0.902 | 1.804 | 2.706 |
| 2.02004407625825 | 0.901 | 1.802 | 2.702 |
| 2.02318566891184 | 0.899 | 1.799 | 2.698 |
| 2.02632726156543 | 0.898 | 1.796 | 2.694 |
| 2.029468854219019 | 0.897 | 1.793 | 2.69 |
| 2.032610446872609 | 0.895 | 1.79 | 2.686 |
| 2.035752039526198 | 0.894 | 1.788 | 2.682 |
| 2.038893632179788 | 0.892 | 1.785 | 2.677 |
| 2.042035224833378 | 0.891 | 1.782 | 2.673 |
| 2.045176817486967 | 0.89 | 1.779 | 2.669 |
| 2.048318410140557 | 0.888 | 1.776 | 2.664 |
| 2.051460002794146 | 0.887 | 1.773 | 2.66 |
| 2.054601595447736 | 0.885 | 1.77 | 2.656 |
| 2.057743188101325 | 0.884 | 1.768 | 2.651 |
| 2.060884780754915 | 0.882 | 1.765 | 2.647 |
| 2.064026373408505 | 0.881 | 1.762 | 2.642 |
| 2.067167966062094 | 0.879 | 1.759 | 2.638 |
| 2.070309558715684 | 0.878 | 1.756 | 2.633 |
| 2.073451151369273 | 0.876 | 1.753 | 2.629 |
| 2.076592744022863 | 0.875 | 1.75 | 2.624 |
| 2.079734336676452 | 0.873 | 1.747 | 2.62 |
| 2.082875929330042 | 0.872 | 1.743 | 2.615 |
| 2.086017521983632 | 0.87 | 1.74 | 2.611 |
| 2.089159114637221 | 0.869 | 1.737 | 2.606 |
| 2.092300707290811 | 0.867 | 1.734 | 2.601 |
| 2.095442299944401 | 0.866 | 1.731 | 2.597 |
| 2.09858389259799 | 0.864 | 1.728 | 2.592 |
| 2.10172548525158 | 0.862 | 1.725 | 2.587 |
| 2.104867077905169 | 0.861 | 1.721 | 2.582 |
| 2.108008670558759 | 0.859 | 1.718 | 2.577 |
| 2.111150263212349 | 0.858 | 1.715 | 2.573 |
| 2.114291855865938 | 0.856 | 1.712 | 2.568 |
| 2.117433448519528 | 0.854 | 1.709 | 2.563 |
| 2.120575041173117 | 0.853 | 1.705 | 2.558 |
| 2.123716633826707 | 0.851 | 1.702 | 2.553 |
| 2.126858226480297 | 0.849 | 1.699 | 2.548 |
| 2.129999819133886 | 0.848 | 1.695 | 2.543 |
| 2.133141411787476 | 0.846 | 1.692 | 2.538 |
| 2.136283004441065 | 0.844 | 1.689 | 2.533 |
| 2.139424597094655 | 0.843 | 1.685 | 2.528 |
| 2.142566189748245 | 0.841 | 1.682 | 2.523 |
| 2.145707782401834 | 0.839 | 1.678 | 2.518 |
| 2.148849375055424 | 0.838 | 1.675 | 2.513 |
| 2.151990967709013 | 0.836 | 1.672 | 2.507 |
| 2.155132560362603 | 0.834 | 1.668 | 2.502 |
| 2.158274153016193 | 0.832 | 1.665 | 2.497 |
| 2.161415745669782 | 0.831 | 1.661 | 2.492 |
| 2.164557338323372 | 0.829 | 1.658 | 2.487 |
| 2.167698930976961 | 0.827 | 1.654 | 2.481 |
| 2.170840523630551 | 0.825 | 1.651 | 2.476 |
| 2.173982116284141 | 0.824 | 1.647 | 2.471 |
| 2.17712370893773 | 0.822 | 1.643 | 2.465 |
| 2.18026530159132 | 0.82 | 1.64 | 2.46 |
| 2.183406894244909 | 0.818 | 1.636 | 2.454 |
| 2.186548486898499 | 0.816 | 1.633 | 2.449 |
| 2.189690079552089 | 0.815 | 1.629 | 2.444 |
| 2.192831672205678 | 0.813 | 1.625 | 2.438 |
| 2.195973264859268 | 0.811 | 1.622 | 2.433 |
| 2.199114857512857 | 0.809 | 1.618 | 2.427 |
| 2.202256450166447 | 0.807 | 1.614 | 2.421 |
| 2.205398042820036 | 0.805 | 1.611 | 2.416 |
| 2.208539635473626 | 0.803 | 1.607 | 2.41 |
| 2.211681228127216 | 0.802 | 1.603 | 2.405 |
| 2.214822820780805 | 0.8 | 1.599 | 2.399 |
| 2.217964413434395 | 0.798 | 1.596 | 2.393 |
| 2.221106006087984 | 0.796 | 1.592 | 2.388 |
| 2.224247598741574 | 0.794 | 1.588 | 2.382 |
| 2.227389191395164 | 0.792 | 1.584 | 2.376 |
| 2.230530784048753 | 0.79 | 1.58 | 2.37 |
| 2.233672376702343 | 0.788 | 1.576 | 2.365 |
| 2.236813969355933 | 0.786 | 1.573 | 2.359 |
| 2.239955562009522 | 0.784 | 1.569 | 2.353 |
| 2.243097154663112 | 0.782 | 1.565 | 2.347 |
| 2.246238747316701 | 0.78 | 1.561 | 2.341 |
| 2.249380339970291 | 0.778 | 1.557 | 2.335 |
| 2.252521932623881 | 0.776 | 1.553 | 2.329 |
| 2.25566352527747 | 0.775 | 1.549 | 2.324 |
| 2.25880511793106 | 0.773 | 1.545 | 2.318 |
| 2.261946710584649 | 0.771 | 1.541 | 2.312 |
| 2.265088303238239 | 0.769 | 1.537 | 2.306 |
| 2.268229895891829 | 0.766 | 1.533 | 2.299 |
| 2.271371488545418 | 0.764 | 1.529 | 2.293 |
| 2.274513081199008 | 0.762 | 1.525 | 2.287 |
| 2.277654673852597 | 0.76 | 1.521 | 2.281 |
| 2.280796266506186 | 0.758 | 1.517 | 2.275 |
| 2.283937859159776 | 0.756 | 1.513 | 2.269 |
| 2.287079451813366 | 0.754 | 1.509 | 2.263 |
| 2.290221044466955 | 0.752 | 1.504 | 2.257 |
| 2.293362637120545 | 0.75 | 1.5 | 2.25 |
| 2.296504229774135 | 0.748 | 1.496 | 2.244 |
| 2.299645822427724 | 0.746 | 1.492 | 2.238 |
| 2.302787415081314 | 0.744 | 1.488 | 2.232 |
| 2.305929007734904 | 0.742 | 1.483 | 2.225 |
| 2.309070600388493 | 0.74 | 1.479 | 2.219 |
| 2.312212193042083 | 0.738 | 1.475 | 2.213 |
| 2.315353785695672 | 0.735 | 1.471 | 2.206 |
| 2.318495378349262 | 0.733 | 1.467 | 2.2 |
| 2.321636971002852 | 0.731 | 1.462 | 2.193 |
| 2.324778563656441 | 0.729 | 1.458 | 2.187 |
| 2.327920156310031 | 0.727 | 1.454 | 2.18 |
| 2.33106174896362 | 0.725 | 1.449 | 2.174 |
| 2.33420334161721 | 0.722 | 1.445 | 2.167 |
| 2.3373449342708 | 0.72 | 1.441 | 2.161 |
| 2.340486526924389 | 0.718 | 1.436 | 2.154 |
| 2.343628119577979 | 0.716 | 1.432 | 2.148 |
| 2.346769712231568 | 0.714 | 1.427 | 2.141 |
| 2.349911304885158 | 0.712 | 1.423 | 2.135 |
| 2.353052897538748 | 0.709 | 1.419 | 2.128 |
| 2.356194490192337 | 0.707 | 1.414 | 2.121 |
| 2.359336082845927 | 0.705 | 1.41 | 2.115 |
| 2.362477675499516 | 0.703 | 1.405 | 2.108 |
| 2.365619268153106 | 0.7 | 1.401 | 2.101 |
| 2.368760860806696 | 0.698 | 1.396 | 2.094 |
| 2.371902453460285 | 0.696 | 1.392 | 2.088 |
| 2.375044046113875 | 0.694 | 1.387 | 2.081 |
| 2.378185638767464 | 0.691 | 1.383 | 2.074 |
| 2.381327231421054 | 0.689 | 1.378 | 2.067 |
| 2.384468824074644 | 0.687 | 1.374 | 2.061 |
| 2.387610416728233 | 0.685 | 1.369 | 2.054 |
| 2.390752009381823 | 0.682 | 1.365 | 2.047 |
| 2.393893602035412 | 0.68 | 1.36 | 2.04 |
| 2.397035194689002 | 0.678 | 1.355 | 2.033 |
| 2.400176787342591 | 0.675 | 1.351 | 2.026 |
| 2.403318379996181 | 0.673 | 1.346 | 2.019 |
| 2.406459972649771 | 0.671 | 1.341 | 2.012 |
| 2.40960156530336 | 0.668 | 1.337 | 2.005 |
| 2.41274315795695 | 0.666 | 1.332 | 1.998 |
| 2.41588475061054 | 0.664 | 1.327 | 1.991 |
| 2.419026343264129 | 0.661 | 1.323 | 1.984 |
| 2.422167935917719 | 0.659 | 1.318 | 1.977 |
| 2.425309528571308 | 0.657 | 1.313 | 1.97 |
| 2.428451121224898 | 0.654 | 1.308 | 1.963 |
| 2.431592713878488 | 0.652 | 1.304 | 1.956 |
| 2.434734306532077 | 0.649 | 1.299 | 1.948 |
| 2.437875899185667 | 0.647 | 1.294 | 1.941 |
| 2.441017491839256 | 0.645 | 1.289 | 1.934 |
| 2.444159084492846 | 0.642 | 1.285 | 1.927 |
| 2.447300677146435 | 0.64 | 1.28 | 1.92 |
| 2.450442269800025 | 0.637 | 1.275 | 1.912 |
| 2.453583862453615 | 0.635 | 1.27 | 1.905 |
| 2.456725455107204 | 0.633 | 1.265 | 1.898 |
| 2.459867047760794 | 0.63 | 1.26 | 1.89 |
| 2.463008640414384 | 0.628 | 1.255 | 1.883 |
| 2.466150233067973 | 0.625 | 1.25 | 1.876 |
| 2.469291825721563 | 0.623 | 1.246 | 1.868 |
| 2.472433418375152 | 0.62 | 1.241 | 1.861 |
| 2.475575011028742 | 0.618 | 1.236 | 1.854 |
| 2.478716603682332 | 0.615 | 1.231 | 1.846 |
| 2.481858196335921 | 0.613 | 1.226 | 1.839 |
| 2.48499978898951 | 0.61 | 1.221 | 1.831 |
| 2.4881413816431 | 0.608 | 1.216 | 1.824 |
| 2.49128297429669 | 0.605 | 1.211 | 1.816 |
| 2.49442456695028 | 0.603 | 1.206 | 1.809 |
| 2.497566159603869 | 0.6 | 1.201 | 1.801 |
| 2.500707752257458 | 0.598 | 1.196 | 1.794 |
| 2.503849344911048 | 0.595 | 1.191 | 1.786 |
| 2.506990937564638 | 0.593 | 1.186 | 1.779 |
| 2.510132530218228 | 0.59 | 1.181 | 1.771 |
| 2.513274122871817 | 0.588 | 1.176 | 1.763 |
| 2.516415715525407 | 0.585 | 1.17 | 1.756 |
| 2.519557308178996 | 0.583 | 1.165 | 1.748 |
| 2.522698900832586 | 0.58 | 1.16 | 1.74 |
| 2.525840493486176 | 0.578 | 1.155 | 1.733 |
| 2.528982086139765 | 0.575 | 1.15 | 1.725 |
| 2.532123678793355 | 0.572 | 1.145 | 1.717 |
| 2.535265271446944 | 0.57 | 1.14 | 1.71 |
| 2.538406864100534 | 0.567 | 1.135 | 1.702 |
| 2.541548456754124 | 0.565 | 1.129 | 1.694 |
| 2.544690049407713 | 0.562 | 1.124 | 1.686 |
| 2.547831642061302 | 0.559 | 1.119 | 1.678 |
| 2.550973234714892 | 0.557 | 1.114 | 1.671 |
| 2.554114827368482 | 0.554 | 1.109 | 1.663 |
| 2.557256420022072 | 0.552 | 1.103 | 1.655 |
| 2.560398012675661 | 0.549 | 1.098 | 1.647 |
| 2.563539605329251 | 0.546 | 1.093 | 1.639 |
| 2.56668119798284 | 0.544 | 1.088 | 1.631 |
| 2.56982279063643 | 0.541 | 1.082 | 1.623 |
| 2.57296438329002 | 0.538 | 1.077 | 1.615 |
| 2.576105975943609 | 0.536 | 1.072 | 1.607 |
| 2.579247568597199 | 0.533 | 1.066 | 1.6 |
| 2.582389161250788 | 0.531 | 1.061 | 1.592 |
| 2.585530753904377 | 0.528 | 1.056 | 1.584 |
| 2.588672346557967 | 0.525 | 1.05 | 1.576 |
| 2.591813939211557 | 0.522 | 1.045 | 1.567 |
| 2.594955531865147 | 0.52 | 1.04 | 1.559 |
| 2.598097124518736 | 0.517 | 1.034 | 1.551 |
| 2.601238717172326 | 0.514 | 1.029 | 1.543 |
| 2.604380309825915 | 0.512 | 1.023 | 1.535 |
| 2.607521902479505 | 0.509 | 1.018 | 1.527 |
| 2.610663495133095 | 0.506 | 1.013 | 1.519 |
| 2.613805087786684 | 0.504 | 1.007 | 1.511 |
| 2.616946680440274 | 0.501 | 1.002 | 1.503 |
| 2.620088273093863 | 0.498 | 0.996 | 1.495 |
| 2.623229865747452 | 0.495 | 0.991 | 1.486 |
| 2.626371458401042 | 0.493 | 0.985 | 1.478 |
| 2.629513051054632 | 0.49 | 0.98 | 1.47 |
| 2.632654643708222 | 0.487 | 0.975 | 1.462 |
| 2.635796236361811 | 0.485 | 0.969 | 1.454 |
| 2.638937829015401 | 0.482 | 0.964 | 1.445 |
| 2.642079421668991 | 0.479 | 0.958 | 1.437 |
| 2.64522101432258 | 0.476 | 0.952 | 1.429 |
| 2.64836260697617 | 0.473 | 0.947 | 1.42 |
| 2.651504199629759 | 0.471 | 0.941 | 1.412 |
| 2.654645792283349 | 0.468 | 0.936 | 1.404 |
| 2.657787384936938 | 0.465 | 0.93 | 1.395 |
| 2.660928977590528 | 0.462 | 0.925 | 1.387 |
| 2.664070570244118 | 0.46 | 0.919 | 1.379 |
| 2.667212162897707 | 0.457 | 0.914 | 1.37 |
| 2.670353755551297 | 0.454 | 0.908 | 1.362 |
| 2.673495348204887 | 0.451 | 0.902 | 1.354 |
| 2.676636940858476 | 0.448 | 0.897 | 1.345 |
| 2.679778533512066 | 0.446 | 0.891 | 1.337 |
| 2.682920126165655 | 0.443 | 0.886 | 1.328 |
| 2.686061718819245 | 0.44 | 0.88 | 1.32 |
| 2.689203311472835 | 0.437 | 0.874 | 1.311 |
| 2.692344904126424 | 0.434 | 0.869 | 1.303 |
| 2.695486496780014 | 0.431 | 0.863 | 1.294 |
| 2.698628089433603 | 0.429 | 0.857 | 1.286 |
| 2.701769682087193 | 0.426 | 0.852 | 1.277 |
| 2.704911274740782 | 0.423 | 0.846 | 1.269 |
| 2.708052867394372 | 0.42 | 0.84 | 1.26 |
| 2.711194460047962 | 0.417 | 0.834 | 1.252 |
| 2.714336052701551 | 0.414 | 0.829 | 1.243 |
| 2.717477645355141 | 0.412 | 0.823 | 1.235 |
| 2.720619238008731 | 0.409 | 0.817 | 1.226 |
| 2.72376083066232 | 0.406 | 0.812 | 1.217 |
| 2.72690242331591 | 0.403 | 0.806 | 1.209 |
| 2.730044015969499 | 0.4 | 0.8 | 1.2 |
| 2.733185608623089 | 0.397 | 0.794 | 1.191 |
| 2.736327201276678 | 0.394 | 0.789 | 1.183 |
| 2.739468793930268 | 0.391 | 0.783 | 1.174 |
| 2.742610386583858 | 0.388 | 0.777 | 1.165 |
| 2.745751979237447 | 0.386 | 0.771 | 1.157 |
| 2.748893571891036 | 0.383 | 0.765 | 1.148 |
| 2.752035164544627 | 0.38 | 0.76 | 1.139 |
| 2.755176757198216 | 0.377 | 0.754 | 1.131 |
| 2.758318349851806 | 0.374 | 0.748 | 1.122 |
| 2.761459942505395 | 0.371 | 0.742 | 1.113 |
| 2.764601535158985 | 0.368 | 0.736 | 1.104 |
| 2.767743127812574 | 0.365 | 0.73 | 1.096 |
| 2.770884720466164 | 0.362 | 0.725 | 1.087 |
| 2.774026313119754 | 0.359 | 0.719 | 1.078 |
| 2.777167905773343 | 0.356 | 0.713 | 1.069 |
| 2.780309498426932 | 0.353 | 0.707 | 1.06 |
| 2.783451091080522 | 0.351 | 0.701 | 1.052 |
| 2.786592683734112 | 0.348 | 0.695 | 1.043 |
| 2.789734276387701 | 0.345 | 0.689 | 1.034 |
| 2.792875869041291 | 0.342 | 0.683 | 1.025 |
| 2.796017461694881 | 0.339 | 0.677 | 1.016 |
| 2.79915905434847 | 0.336 | 0.672 | 1.007 |
| 2.80230064700206 | 0.333 | 0.666 | 0.998 |
| 2.80544223965565 | 0.33 | 0.66 | 0.99 |
| 2.808583832309239 | 0.327 | 0.654 | 0.981 |
| 2.811725424962829 | 0.324 | 0.648 | 0.972 |
| 2.814867017616419 | 0.321 | 0.642 | 0.963 |
| 2.818008610270008 | 0.318 | 0.636 | 0.954 |
| 2.821150202923598 | 0.315 | 0.63 | 0.945 |
| 2.824291795577187 | 0.312 | 0.624 | 0.936 |
| 2.827433388230777 | 0.309 | 0.618 | 0.927 |
| 2.830574980884366 | 0.306 | 0.612 | 0.918 |
| 2.833716573537956 | 0.303 | 0.606 | 0.909 |
| 2.836858166191546 | 0.3 | 0.6 | 0.9 |
| 2.839999758845135 | 0.297 | 0.594 | 0.891 |
| 2.843141351498725 | 0.294 | 0.588 | 0.882 |
| 2.846282944152314 | 0.291 | 0.582 | 0.873 |
| 2.849424536805904 | 0.288 | 0.576 | 0.864 |
| 2.852566129459494 | 0.285 | 0.57 | 0.855 |
| 2.855707722113083 | 0.282 | 0.564 | 0.846 |
| 2.858849314766673 | 0.279 | 0.558 | 0.837 |
| 2.861990907420262 | 0.276 | 0.552 | 0.828 |
| 2.865132500073852 | 0.273 | 0.546 | 0.819 |
| 2.868274092727442 | 0.27 | 0.54 | 0.81 |
| 2.871415685381031 | 0.267 | 0.534 | 0.801 |
| 2.874557278034621 | 0.264 | 0.528 | 0.792 |
| 2.87769887068821 | 0.261 | 0.522 | 0.783 |
| 2.8808404633418 | 0.258 | 0.516 | 0.773 |
| 2.88398205599539 | 0.255 | 0.51 | 0.764 |
| 2.88712364864898 | 0.252 | 0.503 | 0.755 |
| 2.890265241302569 | 0.249 | 0.497 | 0.746 |
| 2.893406833956158 | 0.246 | 0.491 | 0.737 |
| 2.896548426609748 | 0.243 | 0.485 | 0.728 |
| 2.899690019263338 | 0.24 | 0.479 | 0.719 |
| 2.902831611916927 | 0.236 | 0.473 | 0.709 |
| 2.905973204570517 | 0.233 | 0.467 | 0.7 |
| 2.909114797224106 | 0.23 | 0.461 | 0.691 |
| 2.912256389877696 | 0.227 | 0.455 | 0.682 |
| 2.915397982531286 | 0.224 | 0.449 | 0.673 |
| 2.918539575184875 | 0.221 | 0.442 | 0.664 |
| 2.921681167838465 | 0.218 | 0.436 | 0.654 |
| 2.924822760492054 | 0.215 | 0.43 | 0.645 |
| 2.927964353145644 | 0.212 | 0.424 | 0.636 |
| 2.931105945799234 | 0.209 | 0.418 | 0.627 |
| 2.934247538452823 | 0.206 | 0.412 | 0.618 |
| 2.937389131106413 | 0.203 | 0.406 | 0.608 |
| 2.940530723760002 | 0.2 | 0.399 | 0.599 |
| 2.943672316413592 | 0.197 | 0.393 | 0.59 |
| 2.946813909067182 | 0.194 | 0.387 | 0.581 |
| 2.949955501720771 | 0.19 | 0.381 | 0.571 |
| 2.953097094374361 | 0.187 | 0.375 | 0.562 |
| 2.95623868702795 | 0.184 | 0.369 | 0.553 |
| 2.95938027968154 | 0.181 | 0.362 | 0.544 |
| 2.96252187233513 | 0.178 | 0.356 | 0.534 |
| 2.965663464988719 | 0.175 | 0.35 | 0.525 |
| 2.968805057642309 | 0.172 | 0.344 | 0.516 |
| 2.971946650295898 | 0.169 | 0.338 | 0.507 |
| 2.975088242949488 | 0.166 | 0.331 | 0.497 |
| 2.978229835603078 | 0.163 | 0.325 | 0.488 |
| 2.981371428256667 | 0.16 | 0.319 | 0.479 |
| 2.984513020910257 | 0.156 | 0.313 | 0.469 |
| 2.987654613563846 | 0.153 | 0.307 | 0.46 |
| 2.990796206217436 | 0.15 | 0.3 | 0.451 |
| 2.993937798871025 | 0.147 | 0.294 | 0.441 |
| 2.997079391524615 | 0.144 | 0.288 | 0.432 |
| 3.000220984178205 | 0.141 | 0.282 | 0.423 |
| 3.003362576831794 | 0.138 | 0.276 | 0.413 |
| 3.006504169485384 | 0.135 | 0.269 | 0.404 |
| 3.009645762138974 | 0.132 | 0.263 | 0.395 |
| 3.012787354792563 | 0.128 | 0.257 | 0.385 |
| 3.015928947446153 | 0.125 | 0.251 | 0.376 |
| 3.019070540099742 | 0.122 | 0.244 | 0.367 |
| 3.022212132753332 | 0.119 | 0.238 | 0.357 |
| 3.025353725406922 | 0.116 | 0.232 | 0.348 |
| 3.028495318060511 | 0.113 | 0.226 | 0.339 |
| 3.031636910714101 | 0.11 | 0.219 | 0.329 |
| 3.03477850336769 | 0.107 | 0.213 | 0.32 |
| 3.03792009602128 | 0.103 | 0.207 | 0.31 |
| 3.04106168867487 | 0.1 | 0.201 | 0.301 |
| 3.04420328132846 | 0.097 | 0.194 | 0.292 |
| 3.047344873982049 | 0.094 | 0.188 | 0.282 |
| 3.050486466635638 | 0.091 | 0.182 | 0.273 |
| 3.053628059289228 | 0.088 | 0.176 | 0.264 |
| 3.056769651942818 | 0.085 | 0.169 | 0.254 |
| 3.059911244596407 | 0.082 | 0.163 | 0.245 |
| 3.063052837249997 | 0.078 | 0.157 | 0.235 |
| 3.066194429903586 | 0.075 | 0.151 | 0.226 |
| 3.069336022557176 | 0.072 | 0.144 | 0.217 |
| 3.072477615210766 | 0.069 | 0.138 | 0.207 |
| 3.075619207864355 | 0.066 | 0.132 | 0.198 |
| 3.078760800517945 | 0.063 | 0.126 | 0.188 |
| 3.081902393171534 | 0.06 | 0.119 | 0.179 |
| 3.085043985825124 | 0.057 | 0.113 | 0.17 |
| 3.088185578478713 | 0.053 | 0.107 | 0.16 |
| 3.091327171132303 | 0.05 | 0.1 | 0.151 |
| 3.094468763785893 | 0.047 | 0.094 | 0.141 |
| 3.097610356439482 | 0.044 | 0.088 | 0.132 |
| 3.100751949093072 | 0.041 | 0.082 | 0.122 |
| 3.103893541746661 | 0.038 | 0.075 | 0.113 |
| 3.107035134400251 | 0.035 | 0.069 | 0.104 |
| 3.110176727053841 | 0.031 | 0.063 | 0.094 |
| 3.11331831970743 | 0.028 | 0.057 | 0.085 |
| 3.11645991236102 | 0.025 | 0.05 | 0.075 |
| 3.11960150501461 | 0.022 | 0.044 | 0.066 |
| 3.122743097668199 | 0.019 | 0.038 | 0.057 |
| 3.125884690321789 | 0.016 | 0.031 | 0.047 |
| 3.129026282975378 | 0.013 | 0.025 | 0.038 |
| 3.132167875628968 | 0.009 | 0.019 | 0.028 |
| 3.135309468282557 | 0.006 | 0.013 | 0.019 |
| 3.138451060936147 | 0.003 | 0.006 | 0.009 |
| 3.141592653589737 | 0 | 0 | 0 |
| 3.144734246243326 | 0 | 0 | 0 |
| 3.147875838896916 | 0 | 0 | 0 |
| 3.151017431550505 | 0 | 0 | 0 |
| 3.154159024204095 | 0 | 0 | 0 |
| 3.157300616857685 | 0 | 0 | 0 |
| 3.160442209511274 | 0 | 0 | 0 |
| 3.163583802164864 | 0 | 0 | 0 |
| 3.166725394818453 | 0 | 0 | 0 |
| 3.169866987472043 | 0 | 0 | 0 |
| 3.173008580125633 | 0 | 0 | 0 |
| 3.176150172779222 | 0 | 0 | 0 |
| 3.179291765432812 | 0 | 0 | 0 |
| 3.182433358086401 | 0 | 0 | 0 |
| 3.185574950739991 | 0 | 0 | 0 |
| 3.188716543393581 | 0 | 0 | 0 |
| 3.19185813604717 | 0 | 0 | 0 |
| 3.19499972870076 | 0 | 0 | 0 |
| 3.198141321354349 | 0 | 0 | 0 |
| 3.20128291400794 | 0 | 0 | 0 |
| 3.204424506661528 | 0 | 0 | 0 |
| 3.207566099315118 | 0 | 0 | 0 |
| 3.210707691968708 | 0 | 0 | 0 |
| 3.213849284622297 | 0 | 0 | 0 |
| 3.216990877275887 | 0 | 0 | 0 |
| 3.220132469929476 | 0 | 0 | 0 |
| 3.223274062583066 | 0 | 0 | 0 |
| 3.226415655236656 | 0 | 0 | 0 |
| 3.229557247890245 | 0 | 0 | 0 |
| 3.232698840543835 | 0 | 0 | 0 |
| 3.235840433197425 | 0 | 0 | 0 |
| 3.238982025851014 | 0 | 0 | 0 |
| 3.242123618504604 | 0 | 0 | 0 |
| 3.245265211158193 | 0 | 0 | 0 |
| 3.248406803811783 | 0 | 0 | 0 |
| 3.251548396465373 | 0 | 0 | 0 |
| 3.254689989118962 | 0 | 0 | 0 |
| 3.257831581772551 | 0 | 0 | 0 |
| 3.260973174426141 | 0 | 0 | 0 |
| 3.26411476707973 | 0 | 0 | 0 |
| 3.267256359733321 | 0 | 0 | 0 |
| 3.27039795238691 | 0 | 0 | 0 |
| 3.2735395450405 | 0 | 0 | 0 |
| 3.276681137694089 | 0 | 0 | 0 |
| 3.279822730347679 | 0 | 0 | 0 |
| 3.282964323001269 | 0 | 0 | 0 |
| 3.286105915654858 | 0 | 0 | 0 |
| 3.289247508308448 | 0 | 0 | 0 |
| 3.292389100962037 | 0 | 0 | 0 |
| 3.295530693615627 | 0 | 0 | 0 |
| 3.298672286269217 | 0 | 0 | 0 |
| 3.301813878922806 | 0 | 0 | 0 |
| 3.304955471576396 | 0 | 0 | 0 |
| 3.308097064229985 | 0 | 0 | 0 |
| 3.311238656883575 | 0 | 0 | 0 |
| 3.314380249537165 | 0 | 0 | 0 |
| 3.317521842190754 | 0 | 0 | 0 |
| 3.320663434844344 | 0 | 0 | 0 |
| 3.323805027497933 | 0 | 0 | 0 |
| 3.326946620151523 | 0 | 0 | 0 |
| 3.330088212805113 | 0 | 0 | 0 |
| 3.333229805458702 | 0 | 0 | 0 |
| 3.336371398112292 | 0 | 0 | 0 |
| 3.339512990765881 | 0 | 0 | 0 |
| 3.342654583419471 | 0 | 0 | 0 |
| 3.345796176073061 | 0 | 0 | 0 |
| 3.34893776872665 | 0 | 0 | 0 |
| 3.35207936138024 | 0 | 0 | 0 |
| 3.355220954033829 | 0 | 0 | 0 |
| 3.358362546687419 | 0 | 0 | 0 |
| 3.361504139341009 | 0 | 0 | 0 |
| 3.364645731994598 | 0 | 0 | 0 |
| 3.367787324648188 | 0 | 0 | 0 |
| 3.370928917301777 | 0 | 0 | 0 |
| 3.374070509955367 | 0 | 0 | 0 |
| 3.377212102608956 | 0 | 0 | 0 |
| 3.380353695262546 | 0 | 0 | 0 |
| 3.383495287916136 | 0 | 0 | 0 |
| 3.386636880569725 | 0 | 0 | 0 |
| 3.389778473223315 | 0 | 0 | 0 |
| 3.392920065876904 | 0 | 0 | 0 |
| 3.396061658530494 | 0 | 0 | 0 |
| 3.399203251184084 | 0 | 0 | 0 |
| 3.402344843837673 | 0 | 0 | 0 |
| 3.405486436491263 | 0 | 0 | 0 |
| 3.408628029144852 | 0 | 0 | 0 |
| 3.411769621798442 | 0 | 0 | 0 |
| 3.414911214452032 | 0 | 0 | 0 |
| 3.418052807105621 | 0 | 0 | 0 |
| 3.421194399759211 | 0 | 0 | 0 |
| 3.4243359924128 | 0 | 0 | 0 |
| 3.42747758506639 | 0 | 0 | 0 |
| 3.43061917771998 | 0 | 0 | 0 |
| 3.433760770373569 | 0 | 0 | 0 |
| 3.436902363027159 | 0 | 0 | 0 |
| 3.440043955680748 | 0 | 0 | 0 |
| 3.443185548334338 | 0 | 0 | 0 |
| 3.446327140987927 | 0 | 0 | 0 |
| 3.449468733641517 | 0 | 0 | 0 |
| 3.452610326295107 | 0 | 0 | 0 |
| 3.455751918948696 | 0 | 0 | 0 |
| 3.458893511602286 | 0 | 0 | 0 |
| 3.462035104255876 | 0 | 0 | 0 |
| 3.465176696909465 | 0 | 0 | 0 |
| 3.468318289563055 | 0 | 0 | 0 |
| 3.471459882216644 | 0 | 0 | 0 |
| 3.474601474870234 | 0 | 0 | 0 |
| 3.477743067523824 | 0 | 0 | 0 |
| 3.480884660177413 | 0 | 0 | 0 |
| 3.484026252831002 | 0 | 0 | 0 |
| 3.487167845484592 | 0 | 0 | 0 |
| 3.490309438138182 | 0 | 0 | 0 |
| 3.493451030791772 | 0 | 0 | 0 |
| 3.496592623445361 | 0 | 0 | 0 |
| 3.499734216098951 | 0 | 0 | 0 |
| 3.50287580875254 | 0 | 0 | 0 |
| 3.50601740140613 | 0 | 0 | 0 |
| 3.50915899405972 | 0 | 0 | 0 |
| 3.512300586713309 | 0 | 0 | 0 |
| 3.515442179366899 | 0 | 0 | 0 |
| 3.518583772020488 | 0 | 0 | 0 |
| 3.521725364674078 | 0 | 0 | 0 |
| 3.524866957327668 | 0 | 0 | 0 |
| 3.528008549981257 | 0 | 0 | 0 |
| 3.531150142634847 | 0 | 0 | 0 |
| 3.534291735288436 | 0 | 0 | 0 |
| 3.537433327942026 | 0 | 0 | 0 |
| 3.540574920595616 | 0 | 0 | 0 |
| 3.543716513249205 | 0 | 0 | 0 |
| 3.546858105902795 | 0 | 0 | 0 |
| 3.549999698556384 | 0 | 0 | 0 |
| 3.553141291209974 | 0 | 0 | 0 |
| 3.556282883863564 | 0 | 0 | 0 |
| 3.559424476517153 | 0 | 0 | 0 |
| 3.562566069170743 | 0 | 0 | 0 |
| 3.565707661824332 | 0 | 0 | 0 |
| 3.568849254477922 | 0 | 0 | 0 |
| 3.571990847131511 | 0 | 0 | 0 |
| 3.575132439785101 | 0 | 0 | 0 |
| 3.578274032438691 | 0 | 0 | 0 |
| 3.58141562509228 | 0 | 0 | 0 |
| 3.58455721774587 | 0 | 0 | 0 |
| 3.58769881039946 | 0 | 0 | 0 |
| 3.590840403053049 | 0 | 0 | 0 |
| 3.593981995706639 | 0 | 0 | 0 |
| 3.597123588360228 | 0 | 0 | 0 |
| 3.600265181013818 | 0 | 0 | 0 |
| 3.603406773667407 | 0 | 0 | 0 |
| 3.606548366320997 | 0 | 0 | 0 |
| 3.609689958974587 | 0 | 0 | 0 |
| 3.612831551628176 | 0 | 0 | 0 |
| 3.615973144281766 | 0 | 0 | 0 |
| 3.619114736935355 | 0 | 0 | 0 |
| 3.622256329588945 | 0 | 0 | 0 |
| 3.625397922242534 | 0 | 0 | 0 |
| 3.628539514896124 | 0 | 0 | 0 |
| 3.631681107549714 | 0 | 0 | 0 |
| 3.634822700203303 | 0 | 0 | 0 |
| 3.637964292856893 | 0 | 0 | 0 |
| 3.641105885510483 | 0 | 0 | 0 |
| 3.644247478164072 | 0 | 0 | 0 |
| 3.647389070817662 | 0 | 0 | 0 |
| 3.650530663471251 | 0 | 0 | 0 |
| 3.653672256124841 | 0 | 0 | 0 |
| 3.656813848778431 | 0 | 0 | 0 |
| 3.65995544143202 | 0 | 0 | 0 |
| 3.66309703408561 | 0 | 0 | 0 |
| 3.666238626739199 | 0 | 0 | 0 |
| 3.66938021939279 | 0 | 0 | 0 |
| 3.672521812046378 | 0 | 0 | 0 |
| 3.675663404699968 | 0 | 0 | 0 |
| 3.678804997353558 | 0 | 0 | 0 |
| 3.681946590007147 | 0 | 0 | 0 |
| 3.685088182660737 | 0 | 0 | 0 |
| 3.688229775314326 | 0 | 0 | 0 |
| 3.691371367967916 | 0 | 0 | 0 |
| 3.694512960621506 | 0 | 0 | 0 |
| 3.697654553275095 | 0 | 0 | 0 |
| 3.700796145928685 | 0 | 0 | 0 |
| 3.703937738582274 | 0 | 0 | 0 |
| 3.707079331235864 | 0 | 0 | 0 |
| 3.710220923889454 | 0 | 0 | 0 |
| 3.713362516543043 | 0 | 0 | 0 |
| 3.716504109196633 | 0 | 0 | 0 |
| 3.719645701850223 | 0 | 0 | 0 |
| 3.722787294503812 | 0 | 0 | 0 |
| 3.725928887157402 | 0 | 0 | 0 |
| 3.729070479810991 | 0 | 0 | 0 |
| 3.732212072464581 | 0 | 0 | 0 |
| 3.735353665118171 | 0 | 0 | 0 |
| 3.73849525777176 | 0 | 0 | 0 |
| 3.74163685042535 | 0 | 0 | 0 |
| 3.744778443078939 | 0 | 0 | 0 |
| 3.747920035732529 | 0 | 0 | 0 |
| 3.751061628386119 | 0 | 0 | 0 |
| 3.754203221039708 | 0 | 0 | 0 |
| 3.757344813693298 | 0 | 0 | 0 |
| 3.760486406346887 | 0 | 0 | 0 |
| 3.763627999000477 | 0 | 0 | 0 |
| 3.766769591654067 | 0 | 0 | 0 |
| 3.769911184307656 | 0 | 0 | 0 |
| 3.773052776961246 | 0 | 0 | 0 |
| 3.776194369614835 | 0 | 0 | 0 |
| 3.779335962268425 | 0 | 0 | 0 |
| 3.782477554922014 | 0 | 0 | 0 |
| 3.785619147575604 | 0 | 0 | 0 |
| 3.788760740229193 | 0 | 0 | 0 |
| 3.791902332882783 | 0 | 0 | 0 |
| 3.795043925536373 | 0 | 0 | 0 |
| 3.798185518189962 | 0 | 0 | 0 |
| 3.801327110843552 | 0 | 0 | 0 |
| 3.804468703497142 | 0 | 0 | 0 |
| 3.807610296150731 | 0 | 0 | 0 |
| 3.810751888804321 | 0 | 0 | 0 |
| 3.813893481457911 | 0 | 0 | 0 |
| 3.8170350741115 | 0 | 0 | 0 |
| 3.82017666676509 | 0 | 0 | 0 |
| 3.823318259418679 | 0 | 0 | 0 |
| 3.826459852072269 | 0 | 0 | 0 |
| 3.829601444725859 | 0 | 0 | 0 |
| 3.832743037379448 | 0 | 0 | 0 |
| 3.835884630033038 | 0 | 0 | 0 |
| 3.839026222686627 | 0 | 0 | 0 |
| 3.842167815340217 | 0 | 0 | 0 |
| 3.845309407993807 | 0 | 0 | 0 |
| 3.848451000647396 | 0 | 0 | 0 |
| 3.851592593300986 | 0 | 0 | 0 |
| 3.854734185954575 | 0 | 0 | 0 |
| 3.857875778608165 | 0 | 0 | 0 |
| 3.861017371261755 | 0 | 0 | 0 |
| 3.864158963915344 | 0 | 0 | 0 |
| 3.867300556568933 | 0 | 0 | 0 |
| 3.870442149222523 | 0 | 0 | 0 |
| 3.873583741876112 | 0 | 0 | 0 |
| 3.876725334529703 | 0 | 0 | 0 |
| 3.879866927183292 | 0 | 0 | 0 |
| 3.883008519836882 | 0 | 0 | 0 |
| 3.886150112490471 | 0 | 0 | 0 |
| 3.889291705144061 | 0 | 0 | 0 |
| 3.892433297797651 | 0 | 0 | 0 |
| 3.89557489045124 | 0 | 0 | 0 |
| 3.89871648310483 | 0 | 0 | 0 |
| 3.901858075758419 | 0 | 0 | 0 |
| 3.904999668412009 | 0 | 0 | 0 |
| 3.908141261065598 | 0 | 0 | 0 |
| 3.911282853719188 | 0 | 0 | 0 |
| 3.914424446372778 | 0 | 0 | 0 |
| 3.917566039026367 | 0 | 0 | 0 |
| 3.920707631679957 | 0 | 0 | 0 |
| 3.923849224333547 | 0 | 0 | 0 |
| 3.926990816987136 | 0 | 0 | 0 |
| 3.930132409640726 | 0 | 0 | 0 |
| 3.933274002294315 | 0 | 0 | 0 |
| 3.936415594947905 | 0 | 0 | 0 |
| 3.939557187601495 | 0 | 0 | 0 |
| 3.942698780255084 | 0 | 0 | 0 |
| 3.945840372908674 | 0 | 0 | 0 |
| 3.948981965562263 | 0 | 0 | 0 |
| 3.952123558215853 | 0 | 0 | 0 |
| 3.955265150869442 | 0 | 0 | 0 |
| 3.958406743523032 | 0 | 0 | 0 |
| 3.961548336176622 | 0 | 0 | 0 |
| 3.964689928830211 | 0 | 0 | 0 |
| 3.967831521483801 | 0 | 0 | 0 |
| 3.97097311413739 | 0 | 0 | 0 |
| 3.97411470679098 | 0 | 0 | 0 |
| 3.97725629944457 | 0 | 0 | 0 |
| 3.98039789209816 | 0 | 0 | 0 |
| 3.983539484751749 | 0 | 0 | 0 |
| 3.986681077405338 | 0 | 0 | 0 |
| 3.989822670058928 | 0 | 0 | 0 |
| 3.992964262712517 | 0 | 0 | 0 |
| 3.996105855366107 | 0 | 0 | 0 |
| 3.999247448019697 | 0 | 0 | 0 |
| 4.002389040673287 | 0 | 0 | 0 |
| 4.005530633326877 | 0 | 0 | 0 |
| 4.008672225980466 | 0 | 0 | 0 |
| 4.011813818634056 | 0 | 0 | 0 |
| 4.014955411287645 | 0 | 0 | 0 |
| 4.018097003941234 | 0 | 0 | 0 |
| 4.021238596594824 | 0 | 0 | 0 |
| 4.024380189248414 | 0 | 0 | 0 |
| 4.027521781902004 | 0 | 0 | 0 |
| 4.030663374555593 | 0 | 0 | 0 |
| 4.033804967209183 | 0 | 0 | 0 |
| 4.036946559862773 | 0 | 0 | 0 |
| 4.040088152516362 | 0 | 0 | 0 |
| 4.043229745169951 | 0 | 0 | 0 |
| 4.046371337823541 | 0 | 0 | 0 |
| 4.049512930477131 | 0 | 0 | 0 |
| 4.05265452313072 | 0 | 0 | 0 |
| 4.05579611578431 | 0 | 0 | 0 |
| 4.0589377084379 | 0 | 0 | 0 |
| 4.062079301091489 | 0 | 0 | 0 |
| 4.065220893745079 | 0 | 0 | 0 |
| 4.068362486398668 | 0 | 0 | 0 |
| 4.071504079052258 | 0 | 0 | 0 |
| 4.074645671705848 | 0 | 0 | 0 |
| 4.077787264359437 | 0 | 0 | 0 |
| 4.080928857013027 | 0 | 0 | 0 |
| 4.084070449666616 | 0 | 0 | 0 |
| 4.087212042320206 | 0 | 0 | 0 |
| 4.090353634973795 | 0 | 0 | 0 |
| 4.093495227627385 | 0 | 0 | 0 |
| 4.096636820280975 | 0 | 0 | 0 |
| 4.099778412934564 | 0 | 0 | 0 |
| 4.102920005588154 | 0 | 0 | 0 |
| 4.106061598241744 | 0 | 0 | 0 |
| 4.109203190895333 | 0 | 0 | 0 |
| 4.112344783548923 | 0 | 0 | 0 |
| 4.115486376202512 | 0 | 0 | 0 |
| 4.118627968856102 | 0 | 0 | 0 |
| 4.121769561509692 | 0 | 0 | 0 |
| 4.124911154163281 | 0 | 0 | 0 |
| 4.128052746816871 | 0 | 0 | 0 |
| 4.13119433947046 | 0 | 0 | 0 |
| 4.13433593212405 | 0 | 0 | 0 |
| 4.13747752477764 | 0 | 0 | 0 |
| 4.14061911743123 | 0 | 0 | 0 |
| 4.143760710084818 | 0 | 0 | 0 |
| 4.146902302738408 | 0 | 0 | 0 |
| 4.150043895391998 | 0 | 0 | 0 |
| 4.153185488045588 | 0 | 0 | 0 |
| 4.156327080699177 | 0 | 0 | 0 |
| 4.159468673352766 | 0 | 0 | 0 |
| 4.162610266006356 | 0 | 0 | 0 |
| 4.165751858659946 | 0 | 0 | 0 |
| 4.168893451313535 | 0 | 0 | 0 |
| 4.172035043967125 | 0 | 0 | 0 |
| 4.175176636620715 | 0 | 0 | 0 |
| 4.178318229274304 | 0 | 0 | 0 |
| 4.181459821927894 | 0 | 0 | 0 |
| 4.184601414581484 | 0 | 0 | 0 |
| 4.187743007235073 | 0 | 0 | 0 |
| 4.190884599888663 | 0 | 0 | 0 |
| 4.194026192542252 | 0 | 0 | 0 |
| 4.197167785195842 | 0 | 0 | 0 |
| 4.200309377849432 | 0 | 0 | 0 |
| 4.203450970503021 | 0 | 0 | 0 |
| 4.206592563156611 | 0 | 0 | 0 |
| 4.2097341558102 | 0 | 0 | 0 |
| 4.21287574846379 | 0 | 0 | 0 |
| 4.21601734111738 | 0 | 0 | 0 |
| 4.21915893377097 | 0 | 0 | 0 |
| 4.222300526424559 | 0 | 0 | 0 |
| 4.225442119078148 | 0 | 0 | 0 |
| 4.228583711731738 | 0 | 0 | 0 |
| 4.231725304385327 | 0 | 0 | 0 |
| 4.234866897038917 | 0 | 0 | 0 |
| 4.238008489692506 | 0 | 0 | 0 |
| 4.241150082346096 | 0 | 0 | 0 |
| 4.244291674999685 | 0 | 0 | 0 |
| 4.247433267653276 | 0 | 0 | 0 |
| 4.250574860306865 | 0 | 0 | 0 |
| 4.253716452960455 | 0 | 0 | 0 |
| 4.256858045614044 | 0 | 0 | 0 |
| 4.259999638267634 | 0 | 0 | 0 |
| 4.263141230921224 | 0 | 0 | 0 |
| 4.266282823574813 | 0 | 0 | 0 |
| 4.269424416228403 | 0 | 0 | 0 |
| 4.272566008881992 | 0 | 0 | 0 |
| 4.275707601535582 | 0 | 0 | 0 |
| 4.27884919418917 | 0 | 0 | 0 |
| 4.28199078684276 | 0 | 0 | 0 |
| 4.285132379496351 | 0 | 0 | 0 |
| 4.28827397214994 | 0 | 0 | 0 |
| 4.29141556480353 | 0 | 0 | 0 |
| 4.294557157457119 | 0 | 0 | 0 |
| 4.29769875011071 | 0 | 0 | 0 |
| 4.300840342764299 | 0 | 0 | 0 |
| 4.303981935417888 | 0 | 0 | 0 |
| 4.307123528071478 | 0 | 0 | 0 |
| 4.310265120725067 | 0 | 0 | 0 |
| 4.313406713378657 | 0 | 0 | 0 |
| 4.316548306032247 | 0 | 0 | 0 |
| 4.319689898685836 | 0 | 0 | 0 |
| 4.322831491339426 | 0 | 0 | 0 |
| 4.325973083993015 | 0 | 0 | 0 |
| 4.329114676646605 | 0 | 0 | 0 |
| 4.332256269300195 | 0 | 0 | 0 |
| 4.335397861953784 | 0 | 0 | 0 |
| 4.338539454607374 | 0 | 0 | 0 |
| 4.341681047260963 | 0 | 0 | 0 |
| 4.344822639914553 | 0 | 0 | 0 |
| 4.347964232568143 | 0 | 0 | 0 |
| 4.351105825221732 | 0 | 0 | 0 |
| 4.354247417875322 | 0 | 0 | 0 |
| 4.357389010528911 | 0 | 0 | 0 |
| 4.360530603182501 | 0 | 0 | 0 |
| 4.36367219583609 | 0 | 0 | 0 |
| 4.36681378848968 | 0 | 0 | 0 |
| 4.36995538114327 | 0 | 0 | 0 |
| 4.373096973796859 | 0 | 0 | 0 |
| 4.376238566450449 | 0 | 0 | 0 |
| 4.379380159104038 | 0 | 0 | 0 |
| 4.382521751757628 | 0 | 0 | 0 |
| 4.385663344411217 | 0 | 0 | 0 |
| 4.388804937064807 | 0 | 0 | 0 |
| 4.391946529718397 | 0 | 0 | 0 |
| 4.395088122371987 | 0 | 0 | 0 |
| 4.398229715025576 | 0 | 0 | 0 |
| 4.401371307679165 | 0 | 0 | 0 |
| 4.404512900332755 | 0 | 0 | 0 |
| 4.407654492986345 | 0 | 0 | 0 |
| 4.410796085639934 | 0 | 0 | 0 |
| 4.413937678293524 | 0 | 0 | 0 |
| 4.417079270947114 | 0 | 0 | 0 |
| 4.420220863600703 | 0 | 0 | 0 |
| 4.423362456254293 | 0 | 0 | 0 |
| 4.426504048907883 | 0 | 0 | 0 |
| 4.429645641561472 | 0 | 0 | 0 |
| 4.432787234215062 | 0 | 0 | 0 |
| 4.435928826868651 | 0 | 0 | 0 |
| 4.43907041952224 | 0 | 0 | 0 |
| 4.44221201217583 | 0 | 0 | 0 |
| 4.44535360482942 | 0 | 0 | 0 |
| 4.44849519748301 | 0 | 0 | 0 |
| 4.4516367901366 | 0 | 0 | 0 |
| 4.454778382790188 | 0 | 0 | 0 |
| 4.457919975443779 | 0 | 0 | 0 |
| 4.461061568097368 | 0 | 0 | 0 |
| 4.464203160750958 | 0 | 0 | 0 |
| 4.467344753404547 | 0 | 0 | 0 |
| 4.470486346058137 | 0 | 0 | 0 |
| 4.473627938711726 | 0 | 0 | 0 |
| 4.476769531365316 | 0 | 0 | 0 |
| 4.479911124018905 | 0 | 0 | 0 |
| 4.483052716672495 | 0 | 0 | 0 |
| 4.486194309326085 | 0 | 0 | 0 |
| 4.489335901979674 | 0 | 0 | 0 |
| 4.492477494633264 | 0 | 0 | 0 |
| 4.495619087286854 | 0 | 0 | 0 |
| 4.498760679940443 | 0 | 0 | 0 |
| 4.501902272594033 | 0 | 0 | 0 |
| 4.505043865247622 | 0 | 0 | 0 |
| 4.508185457901212 | 0 | 0 | 0 |
| 4.511327050554801 | 0 | 0 | 0 |
| 4.514468643208391 | 0 | 0 | 0 |
| 4.517610235861981 | 0 | 0 | 0 |
| 4.520751828515571 | 0 | 0 | 0 |
| 4.52389342116916 | 0 | 0 | 0 |
| 4.52703501382275 | 0 | 0 | 0 |
| 4.530176606476339 | 0 | 0 | 0 |
| 4.533318199129928 | 0 | 0 | 0 |
| 4.536459791783518 | 0 | 0 | 0 |
| 4.539601384437108 | 0 | 0 | 0 |
| 4.542742977090698 | 0 | 0 | 0 |
| 4.545884569744287 | 0 | 0 | 0 |
| 4.549026162397876 | 0 | 0 | 0 |
| 4.552167755051466 | 0 | 0 | 0 |
| 4.555309347705056 | 0 | 0 | 0 |
| 4.558450940358646 | 0 | 0 | 0 |
| 4.561592533012235 | 0 | 0 | 0 |
| 4.564734125665825 | 0 | 0 | 0 |
| 4.567875718319415 | 0 | 0 | 0 |
| 4.571017310973004 | 0 | 0 | 0 |
| 4.574158903626594 | 0 | 0 | 0 |
| 4.577300496280183 | 0 | 0 | 0 |
| 4.580442088933772 | 0 | 0 | 0 |
| 4.583583681587362 | 0 | 0 | 0 |
| 4.586725274240952 | 0 | 0 | 0 |
| 4.589866866894542 | 0 | 0 | 0 |
| 4.593008459548131 | 0 | 0 | 0 |
| 4.596150052201721 | 0 | 0 | 0 |
| 4.59929164485531 | 0 | 0 | 0 |
| 4.6024332375089 | 0 | 0 | 0 |
| 4.60557483016249 | 0 | 0 | 0 |
| 4.608716422816079 | 0 | 0 | 0 |
| 4.611858015469668 | 0 | 0 | 0 |
| 4.614999608123258 | 0 | 0 | 0 |
| 4.618141200776848 | 0 | 0 | 0 |
| 4.621282793430437 | 0 | 0 | 0 |
| 4.624424386084027 | 0 | 0 | 0 |
| 4.627565978737617 | 0 | 0 | 0 |
| 4.630707571391206 | 0 | 0 | 0 |
| 4.633849164044795 | 0 | 0 | 0 |
| 4.636990756698386 | 0 | 0 | 0 |
| 4.640132349351975 | 0 | 0 | 0 |
| 4.643273942005564 | 0 | 0 | 0 |
| 4.646415534659154 | 0 | 0 | 0 |
| 4.649557127312744 | 0 | 0 | 0 |
| 4.652698719966334 | 0 | 0 | 0 |
| 4.655840312619923 | 0 | 0 | 0 |
| 4.658981905273513 | 0 | 0 | 0 |
| 4.662123497927102 | 0 | 0 | 0 |
| 4.665265090580692 | 0 | 0 | 0 |
| 4.668406683234282 | 0 | 0 | 0 |
| 4.671548275887871 | 0 | 0 | 0 |
| 4.674689868541461 | 0 | 0 | 0 |
| 4.67783146119505 | 0 | 0 | 0 |
| 4.68097305384864 | 0 | 0 | 0 |
| 4.68411464650223 | 0 | 0 | 0 |
| 4.687256239155819 | 0 | 0 | 0 |
| 4.690397831809409 | 0 | 0 | 0 |
| 4.693539424462998 | 0 | 0 | 0 |
| 4.696681017116588 | 0 | 0 | 0 |
| 4.699822609770177 | 0 | 0 | 0 |
| 4.702964202423767 | 0 | 0 | 0 |
| 4.706105795077356 | 0 | 0 | 0 |
| 4.709247387730946 | 0 | 0 | 0 |
| 4.712388980384535 | 0 | 0 | 0 |
| 4.715530573038126 | 0 | 0 | 0 |
| 4.718672165691715 | 0 | 0 | 0 |
| 4.721813758345305 | 0 | 0 | 0 |
| 4.724955350998894 | 0 | 0 | 0 |
| 4.728096943652484 | 0 | 0 | 0 |
| 4.731238536306074 | 0 | 0 | 0 |
| 4.734380128959663 | 0 | 0 | 0 |
| 4.737521721613253 | 0 | 0 | 0 |
| 4.740663314266842 | 0 | 0 | 0 |
| 4.743804906920432 | 0 | 0 | 0 |
| 4.74694649957402 | 0 | 0 | 0 |
| 4.750088092227611 | 0 | 0 | 0 |
| 4.7532296848812 | 0 | 0 | 0 |
| 4.75637127753479 | 0 | 0 | 0 |
| 4.75951287018838 | 0 | 0 | 0 |
| 4.76265446284197 | 0 | 0 | 0 |
| 4.765796055495559 | 0 | 0 | 0 |
| 4.768937648149149 | 0 | 0 | 0 |
| 4.772079240802738 | 0 | 0 | 0 |
| 4.775220833456327 | 0 | 0 | 0 |
| 4.778362426109917 | 0 | 0 | 0 |
| 4.781504018763507 | 0 | 0 | 0 |
| 4.784645611417097 | 0 | 0 | 0 |
| 4.787787204070686 | 0 | 0 | 0 |
| 4.790928796724275 | 0 | 0 | 0 |
| 4.794070389377865 | 0 | 0 | 0 |
| 4.797211982031455 | 0 | 0 | 0 |
| 4.800353574685045 | 0 | 0 | 0 |
| 4.803495167338634 | 0 | 0 | 0 |
| 4.806636759992224 | 0 | 0 | 0 |
| 4.809778352645814 | 0 | 0 | 0 |
| 4.812919945299403 | 0 | 0 | 0 |
| 4.816061537952993 | 0 | 0 | 0 |
| 4.819203130606582 | 0 | 0 | 0 |
| 4.822344723260172 | 0 | 0 | 0 |
| 4.825486315913761 | 0 | 0 | 0 |
| 4.828627908567351 | 0 | 0 | 0 |
| 4.83176950122094 | 0 | 0 | 0 |
| 4.83491109387453 | 0 | 0 | 0 |
| 4.83805268652812 | 0 | 0 | 0 |
| 4.841194279181709 | 0 | 0 | 0 |
| 4.844335871835299 | 0 | 0 | 0 |
| 4.847477464488889 | 0 | 0 | 0 |
| 4.850619057142478 | 0 | 0 | 0 |
| 4.853760649796068 | 0 | 0 | 0 |
| 4.856902242449657 | 0 | 0 | 0 |
| 4.860043835103247 | 0 | 0 | 0 |
| 4.863185427756837 | 0 | 0 | 0 |
| 4.866327020410426 | 0 | 0 | 0 |
| 4.869468613064015 | 0 | 0 | 0 |
| 4.872610205717605 | 0 | 0 | 0 |
| 4.875751798371195 | 0 | 0 | 0 |
| 4.878893391024784 | 0 | 0 | 0 |
| 4.882034983678374 | 0 | 0 | 0 |
| 4.885176576331964 | 0 | 0 | 0 |
| 4.888318168985553 | 0 | 0 | 0 |
| 4.891459761639143 | 0 | 0 | 0 |
| 4.894601354292733 | 0 | 0 | 0 |
| 4.897742946946322 | 0 | 0 | 0 |
| 4.900884539599912 | 0 | 0 | 0 |
| 4.904026132253501 | 0 | 0 | 0 |
| 4.907167724907091 | 0 | 0 | 0 |
| 4.91030931756068 | 0 | 0 | 0 |
| 4.91345091021427 | 0 | 0 | 0 |
| 4.91659250286786 | 0 | 0 | 0 |
| 4.91973409552145 | 0 | 0 | 0 |
| 4.922875688175039 | 0 | 0 | 0 |
| 4.926017280828628 | 0 | 0 | 0 |
| 4.929158873482218 | 0 | 0 | 0 |
| 4.932300466135808 | 0 | 0 | 0 |
| 4.935442058789397 | 0 | 0 | 0 |
| 4.938583651442987 | 0 | 0 | 0 |
| 4.941725244096576 | 0 | 0 | 0 |
| 4.944866836750166 | 0 | 0 | 0 |
| 4.948008429403755 | 0 | 0 | 0 |
| 4.951150022057345 | 0 | 0 | 0 |
| 4.954291614710935 | 0 | 0 | 0 |
| 4.957433207364524 | 0 | 0 | 0 |
| 4.960574800018114 | 0 | 0 | 0 |
| 4.963716392671704 | 0 | 0 | 0 |
| 4.966857985325293 | 0 | 0 | 0 |
| 4.969999577978883 | 0 | 0 | 0 |
| 4.973141170632472 | 0 | 0 | 0 |
| 4.976282763286062 | 0 | 0 | 0 |
| 4.979424355939651 | 0 | 0 | 0 |
| 4.982565948593241 | 0 | 0 | 0 |
| 4.985707541246831 | 0 | 0 | 0 |
| 4.98884913390042 | 0 | 0 | 0 |
| 4.99199072655401 | 0 | 0 | 0 |
| 4.9951323192076 | 0 | 0 | 0 |
| 4.99827391186119 | 0 | 0 | 0 |
| 5.00141550451478 | 0 | 0 | 0 |
| 5.004557097168369 | 0 | 0 | 0 |
| 5.007698689821958 | 0 | 0 | 0 |
| 5.010840282475548 | 0 | 0 | 0 |
| 5.013981875129137 | 0 | 0 | 0 |
| 5.017123467782727 | 0 | 0 | 0 |
| 5.020265060436317 | 0 | 0 | 0 |
| 5.023406653089906 | 0 | 0 | 0 |
| 5.026548245743496 | 0 | 0 | 0 |
| 5.029689838397085 | 0 | 0 | 0 |
| 5.032831431050674 | 0 | 0 | 0 |
| 5.035973023704264 | 0 | 0 | 0 |
| 5.039114616357854 | 0 | 0 | 0 |
| 5.042256209011444 | 0 | 0 | 0 |
| 5.045397801665033 | 0 | 0 | 0 |
| 5.048539394318622 | 0 | 0 | 0 |
| 5.051680986972213 | 0 | 0 | 0 |
| 5.054822579625802 | 0 | 0 | 0 |
| 5.057964172279392 | 0 | 0 | 0 |
| 5.061105764932981 | 0 | 0 | 0 |
| 5.064247357586571 | 0 | 0 | 0 |
| 5.067388950240161 | 0 | 0 | 0 |
| 5.07053054289375 | 0 | 0 | 0 |
| 5.07367213554734 | 0 | 0 | 0 |
| 5.07681372820093 | 0 | 0 | 0 |
| 5.079955320854519 | 0 | 0 | 0 |
| 5.083096913508108 | 0 | 0 | 0 |
| 5.086238506161698 | 0 | 0 | 0 |
| 5.089380098815288 | 0 | 0 | 0 |
| 5.092521691468877 | 0 | 0 | 0 |
| 5.095663284122466 | 0 | 0 | 0 |
| 5.098804876776057 | 0 | 0 | 0 |
| 5.101946469429646 | 0 | 0 | 0 |
| 5.105088062083236 | 0 | 0 | 0 |
| 5.108229654736825 | 0 | 0 | 0 |
| 5.111371247390415 | 0 | 0 | 0 |
| 5.114512840044005 | 0 | 0 | 0 |
| 5.117654432697594 | 0 | 0 | 0 |
| 5.120796025351184 | 0 | 0 | 0 |
| 5.123937618004773 | 0 | 0 | 0 |
| 5.127079210658363 | 0 | 0 | 0 |
| 5.130220803311953 | 0 | 0 | 0 |
| 5.133362395965542 | 0 | 0 | 0 |
| 5.136503988619131 | 0 | 0 | 0 |
| 5.13964558127272 | 0 | 0 | 0 |
| 5.142787173926311 | 0 | 0 | 0 |
| 5.1459287665799 | 0 | 0 | 0 |
| 5.14907035923349 | 0 | 0 | 0 |
| 5.15221195188708 | 0 | 0 | 0 |
| 5.15535354454067 | 0 | 0 | 0 |
| 5.158495137194259 | 0 | 0 | 0 |
| 5.161636729847848 | 0 | 0 | 0 |
| 5.164778322501438 | 0 | 0 | 0 |
| 5.167919915155028 | 0 | 0 | 0 |
| 5.171061507808617 | 0 | 0 | 0 |
| 5.174203100462206 | 0 | 0 | 0 |
| 5.177344693115796 | 0 | 0 | 0 |
| 5.180486285769386 | 0 | 0 | 0 |
| 5.183627878422976 | 0 | 0 | 0 |
| 5.186769471076565 | 0 | 0 | 0 |
| 5.189911063730155 | 0 | 0 | 0 |
| 5.193052656383744 | 0 | 0 | 0 |
| 5.196194249037334 | 0 | 0 | 0 |
| 5.199335841690924 | 0 | 0 | 0 |
| 5.202477434344513 | 0 | 0 | 0 |
| 5.205619026998103 | 0 | 0 | 0 |
| 5.208760619651692 | 0 | 0 | 0 |
| 5.211902212305282 | 0 | 0 | 0 |
| 5.215043804958871 | 0 | 0 | 0 |
| 5.218185397612461 | 0 | 0 | 0 |
| 5.221326990266051 | 0 | 0 | 0 |
| 5.22446858291964 | 0 | 0 | 0 |
| 5.22761017557323 | 0 | 0 | 0 |
| 5.23075176822682 | 0 | 0 | 0 |
| 5.23389336088041 | 0 | 0 | 0 |
| 5.237034953533999 | 0 | 0 | 0 |
| 5.240176546187588 | 0 | 0 | 0 |
| 5.243318138841178 | 0 | 0 | 0 |
| 5.246459731494767 | 0 | 0 | 0 |
| 5.249601324148357 | 0 | 0 | 0 |
| 5.252742916801947 | 0 | 0 | 0 |
| 5.255884509455536 | 0 | 0 | 0 |
| 5.259026102109125 | 0 | 0 | 0 |
| 5.262167694762715 | 0 | 0 | 0 |
| 5.265309287416305 | 0 | 0 | 0 |
| 5.268450880069895 | 0 | 0 | 0 |
| 5.271592472723484 | 0 | 0 | 0 |
| 5.274734065377074 | 0 | 0 | 0 |
| 5.277875658030664 | 0 | 0 | 0 |
| 5.281017250684253 | 0 | 0 | 0 |
| 5.284158843337843 | 0 | 0 | 0 |
| 5.287300435991432 | 0 | 0 | 0 |
| 5.290442028645022 | 0 | 0 | 0 |
| 5.293583621298612 | 0 | 0 | 0 |
| 5.296725213952201 | 0 | 0 | 0 |
| 5.299866806605791 | 0 | 0 | 0 |
| 5.30300839925938 | 0 | 0 | 0 |
| 5.30614999191297 | 0 | 0 | 0 |
| 5.30929158456656 | 0 | 0 | 0 |
| 5.312433177220149 | 0 | 0 | 0 |
| 5.315574769873739 | 0 | 0 | 0 |
| 5.318716362527328 | 0 | 0 | 0 |
| 5.321857955180918 | 0 | 0 | 0 |
| 5.324999547834508 | 0 | 0 | 0 |
| 5.328141140488097 | 0 | 0 | 0 |
| 5.331282733141686 | 0 | 0 | 0 |
| 5.334424325795276 | 0 | 0 | 0 |
| 5.337565918448866 | 0 | 0 | 0 |
| 5.340707511102456 | 0 | 0 | 0 |
| 5.343849103756045 | 0 | 0 | 0 |
| 5.346990696409634 | 0 | 0 | 0 |
| 5.350132289063224 | 0 | 0 | 0 |
| 5.353273881716814 | 0 | 0 | 0 |
| 5.356415474370403 | 0 | 0 | 0 |
| 5.359557067023993 | 0 | 0 | 0 |
| 5.362698659677583 | 0 | 0 | 0 |
| 5.365840252331172 | 0 | 0 | 0 |
| 5.368981844984762 | 0 | 0 | 0 |
| 5.372123437638351 | 0 | 0 | 0 |
| 5.375265030291941 | 0 | 0 | 0 |
| 5.378406622945531 | 0 | 0 | 0 |
| 5.38154821559912 | 0 | 0 | 0 |
| 5.38468980825271 | 0 | 0 | 0 |
| 5.387831400906299 | 0 | 0 | 0 |
| 5.39097299355989 | 0 | 0 | 0 |
| 5.394114586213479 | 0 | 0 | 0 |
| 5.397256178867068 | 0 | 0 | 0 |
| 5.400397771520657 | 0 | 0 | 0 |
| 5.403539364174247 | 0 | 0 | 0 |
| 5.406680956827837 | 0 | 0 | 0 |
| 5.409822549481426 | 0 | 0 | 0 |
| 5.412964142135016 | 0 | 0 | 0 |
| 5.416105734788605 | 0 | 0 | 0 |
| 5.419247327442195 | 0 | 0 | 0 |
| 5.422388920095785 | 0 | 0 | 0 |
| 5.425530512749375 | 0 | 0 | 0 |
| 5.428672105402964 | 0 | 0 | 0 |
| 5.431813698056554 | 0 | 0 | 0 |
| 5.434955290710143 | 0 | 0 | 0 |
| 5.438096883363733 | 0 | 0 | 0 |
| 5.441238476017322 | 0 | 0 | 0 |
| 5.444380068670912 | 0 | 0 | 0 |
| 5.447521661324502 | 0 | 0 | 0 |
| 5.450663253978091 | 0 | 0 | 0 |
| 5.453804846631681 | 0 | 0 | 0 |
| 5.456946439285271 | 0 | 0 | 0 |
| 5.46008803193886 | 0 | 0 | 0 |
| 5.46322962459245 | 0 | 0 | 0 |
| 5.466371217246039 | 0 | 0 | 0 |
| 5.46951280989963 | 0 | 0 | 0 |
| 5.472654402553218 | 0 | 0 | 0 |
| 5.475795995206808 | 0 | 0 | 0 |
| 5.478937587860398 | 0 | 0 | 0 |
| 5.482079180513987 | 0 | 0 | 0 |
| 5.485220773167577 | 0 | 0 | 0 |
| 5.488362365821166 | 0 | 0 | 0 |
| 5.491503958474756 | 0 | 0 | 0 |
| 5.494645551128346 | 0 | 0 | 0 |
| 5.497787143781935 | 0 | 0 | 0 |
| 5.500928736435525 | 0 | 0 | 0 |
| 5.504070329089115 | 0 | 0 | 0 |
| 5.507211921742704 | 0 | 0 | 0 |
| 5.510353514396294 | 0 | 0 | 0 |
| 5.513495107049883 | 0 | 0 | 0 |
| 5.516636699703473 | 0 | 0 | 0 |
| 5.519778292357062 | 0 | 0 | 0 |
| 5.522919885010652 | 0 | 0 | 0 |
| 5.526061477664242 | 0 | 0 | 0 |
| 5.529203070317831 | 0 | 0 | 0 |
| 5.532344662971421 | 0 | 0 | 0 |
| 5.535486255625011 | 0 | 0 | 0 |
| 5.5386278482786 | 0 | 0 | 0 |
| 5.54176944093219 | 0 | 0 | 0 |
| 5.544911033585779 | 0 | 0 | 0 |
| 5.54805262623937 | 0 | 0 | 0 |
| 5.551194218892959 | 0 | 0 | 0 |
| 5.554335811546548 | 0 | 0 | 0 |
| 5.557477404200137 | 0 | 0 | 0 |
| 5.560618996853727 | 0 | 0 | 0 |
| 5.563760589507317 | 0 | 0 | 0 |
| 5.566902182160906 | 0 | 0 | 0 |
| 5.570043774814496 | 0 | 0 | 0 |
| 5.573185367468086 | 0 | 0 | 0 |
| 5.576326960121675 | 0 | 0 | 0 |
| 5.579468552775264 | 0 | 0 | 0 |
| 5.582610145428854 | 0 | 0 | 0 |
| 5.585751738082444 | 0 | 0 | 0 |
| 5.588893330736034 | 0 | 0 | 0 |
| 5.592034923389623 | 0 | 0 | 0 |
| 5.595176516043213 | 0 | 0 | 0 |
| 5.598318108696803 | 0 | 0 | 0 |
| 5.601459701350392 | 0 | 0 | 0 |
| 5.604601294003982 | 0 | 0 | 0 |
| 5.607742886657571 | 0 | 0 | 0 |
| 5.610884479311161 | 0 | 0 | 0 |
| 5.61402607196475 | 0 | 0 | 0 |
| 5.61716766461834 | 0 | 0 | 0 |
| 5.62030925727193 | 0 | 0 | 0 |
| 5.623450849925519 | 0 | 0 | 0 |
| 5.626592442579109 | 0 | 0 | 0 |
| 5.629734035232698 | 0 | 0 | 0 |
| 5.632875627886288 | 0 | 0 | 0 |
| 5.636017220539878 | 0 | 0 | 0 |
| 5.639158813193467 | 0 | 0 | 0 |
| 5.642300405847057 | 0 | 0 | 0 |
| 5.645441998500646 | 0 | 0 | 0 |
| 5.648583591154236 | 0 | 0 | 0 |
| 5.651725183807825 | 0 | 0 | 0 |
| 5.654866776461415 | 0 | 0 | 0 |
| 5.658008369115005 | 0 | 0 | 0 |
| 5.661149961768594 | 0 | 0 | 0 |
| 5.664291554422184 | 0 | 0 | 0 |
| 5.667433147075774 | 0 | 0 | 0 |
| 5.670574739729363 | 0 | 0 | 0 |
| 5.673716332382953 | 0 | 0 | 0 |
| 5.676857925036542 | 0 | 0 | 0 |
| 5.679999517690132 | 0 | 0 | 0 |
| 5.683141110343721 | 0 | 0 | 0 |
| 5.686282702997311 | 0 | 0 | 0 |
| 5.689424295650901 | 0 | 0 | 0 |
| 5.69256588830449 | 0 | 0 | 0 |
| 5.69570748095808 | 0 | 0 | 0 |
| 5.69884907361167 | 0 | 0 | 0 |
| 5.701990666265259 | 0 | 0 | 0 |
| 5.705132258918849 | 0 | 0 | 0 |
| 5.708273851572438 | 0 | 0 | 0 |
| 5.711415444226028 | 0 | 0 | 0 |
| 5.714557036879618 | 0 | 0 | 0 |
| 5.717698629533207 | 0 | 0 | 0 |
| 5.720840222186797 | 0 | 0 | 0 |
| 5.723981814840386 | 0 | 0 | 0 |
| 5.727123407493976 | 0 | 0 | 0 |
| 5.730265000147565 | 0 | 0 | 0 |
| 5.733406592801155 | 0 | 0 | 0 |
| 5.736548185454744 | 0 | 0 | 0 |
| 5.739689778108334 | 0 | 0 | 0 |
| 5.742831370761924 | 0 | 0 | 0 |
| 5.745972963415514 | 0 | 0 | 0 |
| 5.749114556069103 | 0 | 0 | 0 |
| 5.752256148722693 | 0 | 0 | 0 |
| 5.755397741376282 | 0 | 0 | 0 |
| 5.758539334029872 | 0 | 0 | 0 |
| 5.761680926683462 | 0 | 0 | 0 |
| 5.764822519337051 | 0 | 0 | 0 |
| 5.767964111990641 | 0 | 0 | 0 |
| 5.77110570464423 | 0 | 0 | 0 |
| 5.77424729729782 | 0 | 0 | 0 |
| 5.77738888995141 | 0 | 0 | 0 |
| 5.780530482605 | 0 | 0 | 0 |
| 5.783672075258588 | 0 | 0 | 0 |
| 5.786813667912178 | 0 | 0 | 0 |
| 5.789955260565768 | 0 | 0 | 0 |
| 5.793096853219358 | 0 | 0 | 0 |
| 5.796238445872947 | 0 | 0 | 0 |
| 5.799380038526537 | 0 | 0 | 0 |
| 5.802521631180126 | 0 | 0 | 0 |
| 5.805663223833715 | 0 | 0 | 0 |
| 5.808804816487306 | 0 | 0 | 0 |
| 5.811946409140895 | 0 | 0 | 0 |
| 5.815088001794485 | 0 | 0 | 0 |
| 5.818229594448074 | 0 | 0 | 0 |
| 5.821371187101663 | 0 | 0 | 0 |
| 5.824512779755254 | 0 | 0 | 0 |
| 5.827654372408843 | 0 | 0 | 0 |
| 5.830795965062433 | 0 | 0 | 0 |
| 5.833937557716022 | 0 | 0 | 0 |
| 5.837079150369612 | 0 | 0 | 0 |
| 5.840220743023201 | 0 | 0 | 0 |
| 5.843362335676791 | 0 | 0 | 0 |
| 5.846503928330381 | 0 | 0 | 0 |
| 5.84964552098397 | 0 | 0 | 0 |
| 5.85278711363756 | 0 | 0 | 0 |
| 5.85592870629115 | 0 | 0 | 0 |
| 5.85907029894474 | 0 | 0 | 0 |
| 5.862211891598329 | 0 | 0 | 0 |
| 5.865353484251918 | 0 | 0 | 0 |
| 5.868495076905508 | 0 | 0 | 0 |
| 5.871636669559098 | 0 | 0 | 0 |
| 5.874778262212687 | 0 | 0 | 0 |
| 5.877919854866277 | 0 | 0 | 0 |
| 5.881061447519866 | 0 | 0 | 0 |
| 5.884203040173456 | 0 | 0 | 0 |
| 5.887344632827046 | 0 | 0 | 0 |
| 5.890486225480635 | 0 | 0 | 0 |
| 5.893627818134224 | 0 | 0 | 0 |
| 5.896769410787814 | 0 | 0 | 0 |
| 5.899911003441404 | 0 | 0 | 0 |
| 5.903052596094994 | 0 | 0 | 0 |
| 5.906194188748583 | 0 | 0 | 0 |
| 5.909335781402172 | 0 | 0 | 0 |
| 5.912477374055762 | 0 | 0 | 0 |
| 5.915618966709352 | 0 | 0 | 0 |
| 5.918760559362942 | 0 | 0 | 0 |
| 5.921902152016531 | 0 | 0 | 0 |
| 5.92504374467012 | 0 | 0 | 0 |
| 5.92818533732371 | 0 | 0 | 0 |
| 5.9313269299773 | 0 | 0 | 0 |
| 5.93446852263089 | 0 | 0 | 0 |
| 5.93761011528448 | 0 | 0 | 0 |
| 5.940751707938068 | 0 | 0 | 0 |
| 5.943893300591658 | 0 | 0 | 0 |
| 5.947034893245248 | 0 | 0 | 0 |
| 5.950176485898837 | 0 | 0 | 0 |
| 5.953318078552427 | 0 | 0 | 0 |
| 5.956459671206017 | 0 | 0 | 0 |
| 5.959601263859606 | 0 | 0 | 0 |
| 5.962742856513196 | 0 | 0 | 0 |
| 5.965884449166785 | 0 | 0 | 0 |
| 5.969026041820375 | 0 | 0 | 0 |
| 5.972167634473964 | 0 | 0 | 0 |
| 5.975309227127554 | 0 | 0 | 0 |
| 5.978450819781144 | 0 | 0 | 0 |
| 5.981592412434733 | 0 | 0 | 0 |
| 5.984734005088323 | 0 | 0 | 0 |
| 5.987875597741913 | 0 | 0 | 0 |
| 5.991017190395502 | 0 | 0 | 0 |
| 5.994158783049092 | 0 | 0 | 0 |
| 5.997300375702681 | 0 | 0 | 0 |
| 6.000441968356271 | 0 | 0 | 0 |
| 6.003583561009861 | 0 | 0 | 0 |
| 6.00672515366345 | 0 | 0 | 0 |
| 6.00986674631704 | 0 | 0 | 0 |
| 6.01300833897063 | 0 | 0 | 0 |
| 6.01614993162422 | 0 | 0 | 0 |
| 6.019291524277808 | 0 | 0 | 0 |
| 6.022433116931398 | 0 | 0 | 0 |
| 6.025574709584988 | 0 | 0 | 0 |
| 6.028716302238577 | 0 | 0 | 0 |
| 6.031857894892167 | 0 | 0 | 0 |
| 6.034999487545757 | 0 | 0 | 0 |
| 6.038141080199346 | 0 | 0 | 0 |
| 6.041282672852935 | 0 | 0 | 0 |
| 6.044424265506525 | 0 | 0 | 0 |
| 6.047565858160115 | 0 | 0 | 0 |
| 6.050707450813704 | 0 | 0 | 0 |
| 6.053849043467294 | 0 | 0 | 0 |
| 6.056990636120884 | 0 | 0 | 0 |
| 6.060132228774473 | 0 | 0 | 0 |
| 6.063273821428063 | 0 | 0 | 0 |
| 6.066415414081653 | 0 | 0 | 0 |
| 6.069557006735242 | 0 | 0 | 0 |
| 6.072698599388831 | 0 | 0 | 0 |
| 6.07584019204242 | 0 | 0 | 0 |
| 6.078981784696011 | 0 | 0 | 0 |
| 6.082123377349601 | 0 | 0 | 0 |
| 6.08526497000319 | 0 | 0 | 0 |
| 6.08840656265678 | 0 | 0 | 0 |
| 6.09154815531037 | 0 | 0 | 0 |
| 6.094689747963959 | 0 | 0 | 0 |
| 6.097831340617549 | 0 | 0 | 0 |
| 6.100972933271138 | 0 | 0 | 0 |
| 6.104114525924728 | 0 | 0 | 0 |
| 6.107256118578317 | 0 | 0 | 0 |
| 6.110397711231907 | 0 | 0 | 0 |
| 6.113539303885497 | 0 | 0 | 0 |
| 6.116680896539086 | 0 | 0 | 0 |
| 6.119822489192675 | 0 | 0 | 0 |
| 6.122964081846265 | 0 | 0 | 0 |
| 6.126105674499855 | 0 | 0 | 0 |
| 6.129247267153445 | 0 | 0 | 0 |
| 6.132388859807034 | 0 | 0 | 0 |
| 6.135530452460624 | 0 | 0 | 0 |
| 6.138672045114213 | 0 | 0 | 0 |
| 6.141813637767803 | 0 | 0 | 0 |
| 6.144955230421393 | 0 | 0 | 0 |
| 6.148096823074982 | 0 | 0 | 0 |
| 6.151238415728571 | 0 | 0 | 0 |
| 6.154380008382161 | 0 | 0 | 0 |
| 6.157521601035751 | 0 | 0 | 0 |
| 6.16066319368934 | 0 | 0 | 0 |
| 6.16380478634293 | 0 | 0 | 0 |
| 6.16694637899652 | 0 | 0 | 0 |
| 6.170087971650109 | 0 | 0 | 0 |
| 6.173229564303698 | 0 | 0 | 0 |
| 6.176371156957289 | 0 | 0 | 0 |
| 6.179512749610878 | 0 | 0 | 0 |
| 6.182654342264468 | 0 | 0 | 0 |
| 6.185795934918057 | 0 | 0 | 0 |
| 6.188937527571647 | 0 | 0 | 0 |
| 6.192079120225237 | 0 | 0 | 0 |
| 6.195220712878826 | 0 | 0 | 0 |
| 6.198362305532415 | 0 | 0 | 0 |
| 6.201503898186005 | 0 | 0 | 0 |
| 6.204645490839594 | 0 | 0 | 0 |
| 6.207787083493184 | 0 | 0 | 0 |
| 6.210928676146774 | 0 | 0 | 0 |
| 6.214070268800364 | 0 | 0 | 0 |
| 6.217211861453953 | 0 | 0 | 0 |
| 6.220353454107543 | 0 | 0 | 0 |
| 6.223495046761133 | 0 | 0 | 0 |
| 6.226636639414722 | 0 | 0 | 0 |
| 6.229778232068312 | 0 | 0 | 0 |
| 6.232919824721901 | 0 | 0 | 0 |
| 6.236061417375491 | 0 | 0 | 0 |
| 6.23920301002908 | 0 | 0 | 0 |
| 6.24234460268267 | 0 | 0 | 0 |
| 6.24548619533626 | 0 | 0 | 0 |
| 6.24862778798985 | 0 | 0 | 0 |
| 6.251769380643438 | 0 | 0 | 0 |
| 6.254910973297028 | 0 | 0 | 0 |
| 6.258052565950618 | 0 | 0 | 0 |
| 6.261194158604208 | 0 | 0 | 0 |
| 6.264335751257797 | 0 | 0 | 0 |
| 6.267477343911387 | 0 | 0 | 0 |
| 6.270618936564976 | 0 | 0 | 0 |
| 6.273760529218566 | 0 | 0 | 0 |
| 6.276902121872155 | 0 | 0 | 0 |
| 6.280043714525745 | 0 | 0 | 0 |
| 6.283185307179335 | 0 | 0 | 0 |